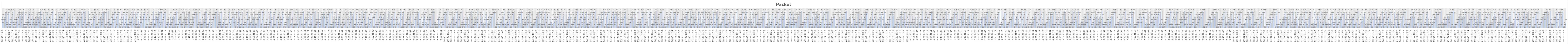
| Category | Packet ID |
|---|---|
| 0.8333912037037038 | 3 |
| 0.8335069444444444 | 4 |
| 0.834212962962963 | 5 |
| 0.8348726851851852 | 2 |
| 0.8348726851851852 | 2 |
| 0.8352199074074074 | 5 |
| 0.8355439814814815 | 3 |
| 0.8356597222222222 | 4 |
| 0.8359375 | 3 |
| 0.836388888888889 | 5 |
| 0.8365625 | 6 |
| 0.8367013888888889 | 4 |
| 0.8367708333333334 | 6 |
| 0.8373379629629629 | 7 |
| 0.8373726851851852 | 1 |
| 0.8377314814814815 | 2 |
| 0.838275462962963 | 0 |
| 0.8386226851851851 | 1 |
| 0.8389583333333334 | 5 |
| 0.8389814814814814 | 6 |
| 0.8395486111111111 | 7 |
| 0.8403125 | 6 |
| 0.8405092592592592 | 0 |
| 0.8408333333333333 | 7 |
| 0.8408564814814815 | 1 |
| 0.8411921296296296 | 0 |
| 0.8417824074074075 | 3 |
| 0.842650462962963 | 2 |
| 0.8435300925925926 | 4 |
| 0.8440393518518517 | 5 |
| 0.8446064814814815 | 7 |
| 0.8448726851851852 | 6 |
| 0.8449421296296297 | 2 |
| 0.8449768518518518 | 0 |
| 0.8451041666666667 | 1 |
| 0.8451967592592592 | 7 |
| 0.8452777777777777 | 2 |
| 0.8464583333333334 | 3 |
| 0.848900462962963 | 1 |
| 0.8489699074074074 | 0 |
| 0.8489930555555555 | 3 |
| 0.8490856481481481 | 2 |
| 0.8493750000000001 | 4 |
| 0.8502777777777778 | 3 |
| 0.8506712962962962 | 4 |
| 0.8513773148148148 | 3 |
| 0.8528819444444444 | 5 |
| 0.8530787037037038 | 4 |
| 0.8532060185185185 | 4 |
| 0.8536342592592593 | 6 |
| 0.8540625 | 1 |
| 0.8558333333333333 | 7 |
| 0.856412037037037 | 5 |
| 0.8565625 | 6 |
| 0.8567361111111111 | 5 |
| 0.8569328703703704 | 2 |
| 0.8573842592592592 | 7 |
| 0.857488425925926 | 6 |
| 0.8580092592592593 | 3 |
| 0.8587962962962963 | 4 |
| 0.858900462962963 | 5 |
| 0.8590509259259259 | 6 |
| 0.8594444444444443 | 0 |
| 0.8596990740740741 | 7 |
| 0.8597453703703705 | 1 |
| 0.8598842592592592 | 7 |
| 0.8600231481481481 | 0 |
| 0.861099537037037 | 5 |
| 0.8619791666666666 | 0 |
| 0.8622800925925925 | 1 |
| 0.8624884259259259 | 6 |
| 0.8638078703703704 | 2 |
| 0.8639236111111112 | 0 |
| 0.8643171296296296 | 1 |
| 0.864375 | 2 |
| 0.8653124999999999 | 3 |
| 0.866400462962963 | 2 |
| 0.8665972222222221 | 4 |
| 0.8668634259259259 | 7 |
| 0.8669328703703704 | 5 |
| 0.8672453703703704 | 0 |
| 0.8680208333333334 | 6 |
| 0.8682407407407408 | 1 |
| 0.8682986111111112 | 2 |
| 0.868576388888889 | 7 |
| 0.8692361111111112 | 3 |
| 0.8699074074074074 | 0 |
| 0.8703587962962963 | 3 |
| 0.8705324074074073 | 4 |
| 0.8708680555555556 | 5 |
| 0.87125 | 1 |
| 0.8714351851851853 | 2 |
| 0.8719675925925926 | 6 |
| 0.8725231481481481 | 7 |
| 0.8726504629629629 | 3 |
| 0.8730439814814814 | 3 |
| 0.8738657407407407 | 0 |
| 0.8740162037037037 | 1 |
| 0.8756365740740741 | 4 |
| 0.8756828703703704 | 4 |
| 0.8761458333333333 | 2 |
| 0.8777893518518519 | 5 |
| 0.877986111111111 | 1 |
| 0.8784490740740741 | 4 |
| 0.8791203703703704 | 6 |
| 0.8792476851851853 | 5 |
| 0.8794097222222222 | 3 |
| 0.8796875000000001 | 4 |
| 0.880011574074074 | 6 |
| 0.8801388888888889 | 2 |
| 0.8804398148148148 | 5 |
| 0.8805787037037037 | 5 |
| 0.8819212962962962 | 6 |
| 0.8822685185185185 | 7 |
| 0.8823148148148148 | 7 |
| 0.8828472222222222 | 0 |
| 0.8834143518518518 | 3 |
| 0.8837037037037038 | 4 |
| 0.8844560185185185 | 5 |
| 0.8849189814814814 | 1 |
| 0.8851736111111111 | 7 |
| 0.8857060185185185 | 0 |
| 0.8861458333333333 | 6 |
| 0.8863657407407407 | 2 |
| 0.8865740740740741 | 0 |
| 0.8877893518518518 | 3 |
| 0.8878125 | 1 |
| 0.8890046296296297 | 7 |
| 0.8892708333333333 | 2 |
| 0.8895370370370371 | 0 |
| 0.8901967592592593 | 6 |
| 0.8902199074074074 | 4 |
| 0.8904861111111111 | 5 |
| 0.8907175925925926 | 3 |
| 0.8908101851851852 | 6 |
| 0.8909837962962963 | 1 |
| 0.8910416666666667 | 2 |
| 0.8920023148148148 | 3 |
| 0.8930671296296296 | 7 |
| 0.8931944444444445 | 4 |
| 0.8933217592592593 | 4 |
| 0.893449074074074 | 1 |
| 0.893449074074074 | 5 |
| 0.8935995370370371 | 0 |
| 0.8936689814814814 | 5 |
| 0.8937268518518519 | 2 |
| 0.8937847222222222 | 6 |
| 0.8947916666666668 | 6 |
| 0.8953587962962963 | 7 |
| 0.8954398148148148 | 3 |
| 0.8961226851851851 | 7 |
| 0.8966898148148149 | 0 |
| 0.896724537037037 | 0 |
| 0.897337962962963 | 1 |
| 0.8975462962962962 | 1 |
| 0.8976388888888889 | 2 |
| 0.8976736111111111 | 4 |
| 0.897824074074074 | 2 |
| 0.8982638888888889 | 3 |
| 0.8990046296296296 | 5 |
| 0.8991782407407407 | 7 |
| 0.8995486111111112 | 3 |
| 0.8997569444444444 | 0 |
| 0.9004050925925925 | 1 |
| 0.9007175925925925 | 2 |
| 0.9009375 | 1 |
| 0.9011342592592593 | 6 |
| 0.9013541666666667 | 3 |
| 0.9017939814814815 | 4 |
| 0.9031250000000001 | 5 |
| 0.9031250000000001 | 2 |
| 0.9052662037037037 | 6 |
| 0.9059606481481483 | 7 |
| 0.9064699074074074 | 3 |
| 0.9067476851851852 | 4 |
| 0.9067592592592592 | 4 |
| 0.9075347222222222 | 5 |
| 0.9075578703703703 | 5 |
| 0.9099537037037037 | 4 |
| 0.9101273148148148 | 7 |
| 0.9103472222222222 | 0 |
| 0.9107175925925927 | 6 |
| 0.9107754629629629 | 5 |
| 0.9120023148148149 | 7 |
| 0.9121643518518519 | 1 |
| 0.9133912037037036 | 6 |
| 0.9134259259259259 | 2 |
| 0.9139814814814815 | 6 |
| 0.914537037037037 | 0 |
| 0.9151273148148148 | 0 |
| 0.9152777777777777 | 7 |
| 0.9158564814814815 | 3 |
| 0.9163310185185186 | 7 |
| 0.9163773148148149 | 1 |
| 0.916875 | 0 |
| 0.9176388888888889 | 2 |
| 0.9180555555555556 | 4 |
| 0.9184490740740742 | 0 |
| 0.9198726851851852 | 5 |
| 0.919988425925926 | 1 |
| 0.9200810185185185 | 3 |
| 0.9202430555555555 | 6 |
| 0.9204745370370371 | 2 |
| 0.9208912037037037 | 1 |
| 0.9211805555555556 | 2 |
| 0.921423611111111 | 7 |
| 0.9222916666666667 | 4 |
| 0.9223148148148148 | 0 |
| 0.9229398148148148 | 3 |
| 0.9233796296296296 | 1 |
| 0.9238773148148148 | 2 |
| 0.9241203703703703 | 5 |
| 0.9245023148148147 | 6 |
| 0.9246527777777778 | 1 |
| 0.9252314814814815 | 4 |
| 0.9256828703703704 | 7 |
| 0.9265856481481481 | 0 |
| 0.9265856481481481 | 5 |
| 0.9274421296296297 | 2 |
| 0.9280092592592593 | 3 |
| 0.9283564814814814 | 3 |
| 0.9284722222222223 | 4 |
| 0.9285185185185184 | 5 |
| 0.9287731481481482 | 6 |
| 0.9289236111111111 | 1 |
| 0.9297569444444443 | 4 |
| 0.930300925925926 | 5 |
| 0.9317361111111112 | 2 |
| 0.9318749999999999 | 3 |
| 0.9323032407407408 | 3 |
| 0.9324421296296297 | 6 |
| 0.9327662037037037 | 4 |
| 0.9328240740740741 | 5 |
| 0.9330439814814815 | 6 |
| 0.933287037037037 | 4 |
| 0.9337384259259259 | 7 |
| 0.9338310185185185 | 5 |
| 0.9341782407407407 | 7 |
| 0.9358449074074073 | 0 |
| 0.936111111111111 | 1 |
| 0.9366319444444445 | 6 |
| 0.9366319444444445 | 2 |
| 0.9367708333333334 | 6 |
| 0.9368287037037036 | 7 |
| 0.9376851851851852 | 3 |
| 0.9377777777777778 | 7 |
| 0.9379861111111111 | 4 |
| 0.9382407407407407 | 0 |
| 0.9390740740740741 | 0 |
| 0.9394675925925925 | 0 |
| 0.9395370370370371 | 1 |
| 0.9397337962962963 | 1 |
| 0.9401041666666666 | 1 |
| 0.9402662037037036 | 2 |
| 0.9411805555555556 | 7 |
| 0.9413194444444444 | 2 |
| 0.9413310185185185 | 3 |
| 0.941400462962963 | 2 |
| 0.9416319444444444 | 4 |
| 0.9433680555555556 | 5 |
| 0.9434490740740741 | 0 |
| 0.9438194444444444 | 3 |
| 0.9439004629629629 | 3 |
| 0.9439004629629629 | 1 |
| 0.9439930555555556 | 4 |
| 0.9450462962962963 | 6 |
| 0.9456944444444444 | 2 |
| 0.9461574074074074 | 4 |
| 0.9470949074074074 | 5 |
| 0.9480208333333334 | 5 |
| 0.9482060185185185 | 3 |
| 0.9483912037037037 | 4 |
| 0.9484027777777778 | 6 |
| 0.9487962962962962 | 6 |
| 0.9496064814814815 | 7 |
| 0.9498842592592592 | 7 |
| 0.9504861111111111 | 0 |
| 0.9505324074074074 | 0 |
| 0.9511342592592592 | 5 |
| 0.9529282407407407 | 1 |
| 0.9530671296296296 | 1 |
| 0.9534143518518517 | 2 |
| 0.9537037037037037 | 7 |
| 0.9543171296296297 | 0 |
| 0.9546064814814814 | 3 |
| 0.9555671296296296 | 5 |
| 0.955787037037037 | 2 |
| 0.9557986111111111 | 6 |
| 0.9563773148148148 | 3 |
| 0.9565740740740741 | 4 |
| 0.956851851851852 | 4 |
| 0.956875 | 5 |
| 0.9568981481481481 | 5 |
| 0.9569328703703704 | 1 |
| 0.9572916666666668 | 2 |
| 0.9579050925925926 | 6 |
| 0.9582291666666666 | 7 |
| 0.9584953703703704 | 3 |
| 0.9602662037037036 | 6 |
| 0.960486111111111 | 4 |
| 0.9607986111111111 | 5 |
| 0.9609143518518519 | 7 |
| 0.9609375 | 6 |
| 0.9609606481481481 | 0 |
| 0.9610069444444443 | 0 |
| 0.9618402777777778 | 6 |
| 0.9621064814814816 | 1 |
| 0.9627083333333334 | 7 |
| 0.9645717592592593 | 1 |
| 0.9648958333333333 | 7 |
| 0.9649768518518518 | 0 |
| 0.9650694444444444 | 2 |
| 0.9654050925925927 | 2 |
| 0.9654282407407407 | 7 |
| 0.9654513888888889 | 0 |
| 0.9657754629629629 | 3 |
| 0.9659027777777779 | 3 |
| 0.9666087962962964 | 1 |
| 0.9677430555555556 | 0 |
| 0.9682060185185185 | 1 |
| 0.9685995370370369 | 1 |
| 0.9685995370370369 | 4 |
| 0.9690972222222222 | 2 |
| 0.969212962962963 | 5 |
| 0.9696527777777778 | 4 |
| 0.9696875 | 6 |
| 0.969826388888889 | 3 |
| 0.9699305555555555 | 2 |
| 0.9700347222222222 | 2 |
| 0.9704282407407407 | 3 |
| 0.9705208333333334 | 5 |
| 0.9707986111111112 | 7 |
| 0.9715162037037036 | 6 |
| 0.9726041666666667 | 3 |
| 0.9727662037037037 | 0 |
| 0.9727893518518518 | 4 |
| 0.9731481481481481 | 4 |
| 0.9732986111111112 | 1 |
| 0.97375 | 4 |
| 0.973761574074074 | 5 |
| 0.974224537037037 | 6 |
| 0.9742824074074075 | 7 |
| 0.9746296296296296 | 5 |
| 0.9753472222222223 | 7 |
| 0.9756481481481482 | 6 |
| 0.9767013888888889 | 2 |
| 0.9772916666666666 | 3 |
| 0.9773263888888889 | 0 |
| 0.9774305555555555 | 0 |
| 0.9778703703703703 | 1 |
| 0.978449074074074 | 7 |
| 0.9795138888888889 | 4 |
| 0.9801157407407407 | 5 |
| 0.9812847222222222 | 2 |
| 0.9816435185185185 | 0 |
| 0.981886574074074 | 3 |
| 0.9841203703703704 | 4 |
| 0.9844444444444443 | 5 |
| 0.9845601851851852 | 6 |
| 0.9849074074074075 | 6 |
| 0.985162037037037 | 1 |
| 0.9852314814814815 | 2 |
| 0.9857754629629629 | 7 |
| 0.9869212962962962 | 0 |
| 0.9874074074074074 | 7 |
| 0.9881365740740741 | 3 |
| 0.9890856481481481 | 5 |
| 0.9891898148148148 | 6 |
| 0.9894907407407407 | 1 |
| 0.9895601851851853 | 2 |
| 0.9901967592592592 | 0 |
| 0.9904050925925926 | 7 |
| 0.9913773148148147 | 1 |
| 0.9915625 | 0 |
| 0.9925 | 3 |
| 0.9926041666666667 | 4 |
| 0.9945601851851852 | 1 |
| 0.9947685185185186 | 2 |
| 0.9949537037037036 | 5 |
| 0.9952314814814814 | 2 |
| 0.9952777777777778 | 3 |
| 0.9959606481481481 | 6 |
| 0.997037037037037 | 4 |
| 0.9980555555555556 | 4 |
| 0.9984722222222223 | 7 |
| 0.9986805555555556 | 5 |
| 0.9991550925925926 | 6 |
| 0.9992592592592593 | 1 |
| 0.9994212962962963 | 5 |
| 0.9995949074074074 | 3 |
| 0.9999305555555557 | 2 |
| 0.00030092592592592595 | 7 |
| 0.00042824074074074075 | 6 |
| 0.0005092592592592592 | 0 |
| 0.0011921296296296296 | 1 |
| 0.001412037037037037 | 4 |
| 0.0014351851851851854 | 5 |
| 0.002314814814814815 | 0 |
| 0.002870370370370371 | 1 |
| 0.0029861111111111113 | 7 |
| 0.0036226851851851854 | 6 |
| 0.00431712962962963 | 3 |
| 0.005046296296296296 | 0 |
| 0.005636574074074074 | 7 |
| 0.005740740740740742 | 1 |
| 0.006030092592592593 | 2 |
| 0.006145833333333333 | 4 |
| 0.006168981481481481 | 5 |
| 0.006354166666666667 | 2 |
| 0.006979166666666667 | 3 |
| 0.008368055555555556 | 6 |
| 0.009247685185185185 | 4 |
| 0.010393518518518519 | 7 |
| 0.01064814814814815 | 2 |
| 0.012152777777777778 | 3 |
| 0.012962962962962963 | 4 |
| 0.01347222222222222 | 5 |
| 0.014317129629629631 | 5 |
| 0.014421296296296295 | 6 |
| 0.014467592592592593 | 6 |
| 0.015243055555555557 | 7 |
| 0.015671296296296298 | 7 |
| 0.01685185185185185 | 0 |
| 0.016863425925925928 | 3 |
| 0.017685185185185182 | 4 |
| 0.017997685185185186 | 0 |
| 0.018206018518518517 | 5 |
| 0.018912037037037036 | 1 |
| 0.019212962962962963 | 6 |
| 0.02 | 7 |
| 0.02008101851851852 | 0 |
| 0.020729166666666667 | 2 |
| 0.021504629629629627 | 3 |
| 0.02246527777777778 | 4 |
| 0.022789351851851852 | 0 |
| 0.023715277777777776 | 1 |
| 0.024699074074074078 | 1 |
| 0.024918981481481483 | 0 |
| 0.02539351851851852 | 2 |
| 0.025567129629629634 | 2 |
| 0.025821759259259256 | 1 |
| 0.025914351851851855 | 5 |
| 0.026342592592592588 | 3 |
| 0.026446759259259264 | 6 |
| 0.02732638888888889 | 4 |
| 0.02832175925925926 | 7 |
| 0.02951388888888889 | 0 |
| 0.029861111111111113 | 3 |
| 0.029988425925925922 | 2 |
| 0.030000000000000002 | 1 |
| 0.030694444444444444 | 1 |
| 0.030821759259259257 | 5 |
| 0.03135416666666666 | 6 |
| 0.03172453703703703 | 4 |
| 0.03175925925925926 | 5 |
| 0.03184027777777778 | 2 |
| 0.03239583333333333 | 3 |
| 0.032719907407407406 | 4 |
| 0.033125 | 3 |
| 0.0332175925925926 | 5 |
| 0.03326388888888889 | 7 |
| 0.033344907407407406 | 4 |
| 0.033900462962962966 | 5 |
| 0.03399305555555556 | 6 |
| 0.03446759259259259 | 0 |
| 0.034895833333333334 | 2 |
| 0.0349537037037037 | 1 |
| 0.035937500000000004 | 6 |
| 0.03606481481481481 | 7 |
| 0.03606481481481481 | 6 |
| 0.03612268518518518 | 7 |
| 0.036828703703703704 | 2 |
| 0.03730324074074074 | 3 |
| 0.03760416666666667 | 7 |
| 0.037638888888888895 | 4 |
| 0.03813657407407407 | 3 |
| 0.038356481481481484 | 4 |
| 0.03891203703703704 | 5 |
| 0.04099537037037037 | 6 |
| 0.04100694444444444 | 6 |
| 0.04116898148148148 | 7 |
| 0.04226851851851852 | 0 |
| 0.0425462962962963 | 7 |
| 0.04289351851851852 | 0 |
| 0.042951388888888886 | 1 |
| 0.04378472222222222 | 1 |
| 0.04438657407407407 | 2 |
| 0.0449074074074074 | 3 |
| 0.04532407407407407 | 2 |
| 0.045578703703703705 | 4 |
| 0.04605324074074074 | 3 |
| 0.04725694444444445 | 5 |
| 0.047407407407407405 | 0 |
| 0.04787037037037037 | 0 |
| 0.04792824074074074 | 1 |
| 0.047962962962962964 | 4 |
| 0.04868055555555556 | 6 |
| 0.04894675925925926 | 1 |
| 0.04936342592592593 | 2 |
| 0.049895833333333334 | 3 |
| 0.050509259259259254 | 2 |
| 0.050567129629629635 | 4 |
| 0.0508912037037037 | 0 |
| 0.05125 | 3 |
| 0.05226851851851852 | 5 |
| 0.05226851851851852 | 5 |
| 0.052986111111111116 | 7 |
| 0.053182870370370366 | 4 |
| 0.05368055555555556 | 6 |
| 0.054560185185185184 | 0 |
| 0.05491898148148148 | 6 |
| 0.0567824074074074 | 1 |
| 0.0575462962962963 | 5 |
| 0.058020833333333334 | 7 |
| 0.05912037037037037 | 7 |
| 0.05960648148148148 | 0 |
| 0.059687500000000004 | 0 |
| 0.05975694444444444 | 1 |
| 0.06024305555555556 | 6 |
| 0.06107638888888889 | 2 |
| 0.06131944444444445 | 2 |
| 0.06319444444444444 | 3 |
| 0.06337962962962963 | 4 |
| 0.06354166666666666 | 3 |
| 0.06387731481481482 | 4 |
| 0.06393518518518519 | 5 |
| 0.06409722222222222 | 1 |
| 0.064375 | 5 |
| 0.06449074074074074 | 7 |
| 0.06483796296296296 | 1 |
| 0.06506944444444444 | 0 |
| 0.06512731481481482 | 2 |
| 0.06537037037037037 | 6 |
| 0.06640046296296297 | 2 |
| 0.06652777777777778 | 7 |
| 0.06682870370370371 | 3 |
| 0.06731481481481481 | 6 |
| 0.06827546296296295 | 0 |
| 0.06828703703703703 | 3 |
| 0.06847222222222223 | 4 |
| 0.06849537037037036 | 1 |
| 0.0687037037037037 | 2 |
| 0.06887731481481481 | 7 |
| 0.06902777777777779 | 5 |
| 0.06918981481481482 | 3 |
| 0.06954861111111112 | 1 |
| 0.06974537037037037 | 4 |
| 0.06979166666666667 | 5 |
| 0.07047453703703704 | 6 |
| 0.07059027777777778 | 2 |
| 0.07099537037037036 | 6 |
| 0.07164351851851852 | 7 |
| 0.07231481481481482 | 3 |
| 0.07339120370370371 | 0 |
| 0.07361111111111111 | 1 |
| 0.07383101851851852 | 2 |
| 0.07431712962962962 | 3 |
| 0.07431712962962962 | 0 |
| 0.07437500000000001 | 1 |
| 0.07527777777777778 | 4 |
| 0.07532407407407408 | 5 |
| 0.0758449074074074 | 2 |
| 0.0763888888888889 | 3 |
| 0.07707175925925926 | 4 |
| 0.0775 | 7 |
| 0.0787962962962963 | 5 |
| 0.07914351851851852 | 4 |
| 0.08025462962962963 | 6 |
| 0.08118055555555555 | 5 |
| 0.08313657407407408 | 7 |
| 0.08432870370370371 | 4 |
| 0.08468750000000001 | 7 |
| 0.08497685185185185 | 6 |
| 0.08614583333333332 | 7 |
| 0.08637731481481481 | 5 |
| 0.08689814814814815 | 0 |
| 0.08850694444444444 | 0 |
| 0.08855324074074074 | 1 |
| 0.08905092592592594 | 1 |
| 0.0897800925925926 | 2 |
| 0.08994212962962962 | 2 |
| 0.09019675925925925 | 6 |
| 0.09136574074074073 | 7 |
| 0.09142361111111112 | 3 |
| 0.09163194444444445 | 1 |
| 0.09212962962962963 | 0 |
| 0.09322916666666665 | 2 |
| 0.09379629629629631 | 1 |
| 0.09430555555555555 | 0 |
| 0.09469907407407407 | 4 |
| 0.09484953703703704 | 1 |
| 0.0949537037037037 | 5 |
| 0.09515046296296296 | 3 |
| 0.09519675925925926 | 2 |
| 0.09534722222222221 | 4 |
| 0.09554398148148148 | 6 |
| 0.09559027777777777 | 2 |
| 0.09591435185185186 | 5 |
| 0.0963888888888889 | 7 |
| 0.09726851851851852 | 3 |
| 0.09738425925925925 | 6 |
| 0.09857638888888888 | 7 |
| 0.09873842592592592 | 0 |
| 0.09962962962962962 | 1 |
| 0.10037037037037037 | 0 |
| 0.10059027777777778 | 4 |
| 0.10059027777777778 | 1 |
| 0.1007986111111111 | 2 |
| 0.10081018518518518 | 2 |
| 0.10084490740740741 | 5 |
| 0.10130787037037037 | 3 |
| 0.10144675925925926 | 6 |
| 0.10166666666666667 | 3 |
| 0.10230324074074075 | 7 |
| 0.10358796296296297 | 3 |
| 0.1046875 | 0 |
| 0.10559027777777778 | 1 |
| 0.1067361111111111 | 5 |
| 0.10677083333333333 | 2 |
| 0.10699074074074073 | 3 |
| 0.10960648148148149 | 3 |
| 0.11040509259259258 | 4 |
| 0.11094907407407407 | 4 |
| 0.11153935185185186 | 4 |
| 0.11209490740740741 | 5 |
| 0.1135648148148148 | 5 |
| 0.11362268518518519 | 5 |
| 0.11563657407407407 | 6 |
| 0.11706018518518518 | 4 |
| 0.11739583333333332 | 6 |
| 0.11752314814814814 | 6 |
| 0.11780092592592593 | 7 |
| 0.11791666666666667 | 7 |
| 0.11871527777777778 | 7 |
| 0.11873842592592593 | 0 |
| 0.11949074074074074 | 0 |
| 0.11972222222222222 | 5 |
| 0.12038194444444444 | 1 |
| 0.12064814814814816 | 2 |
| 0.12104166666666666 | 6 |
| 0.12119212962962962 | 1 |
| 0.12262731481481481 | 2 |
| 0.12265046296296296 | 3 |
| 0.12333333333333334 | 7 |
| 0.12361111111111112 | 6 |
| 0.1240162037037037 | 7 |
| 0.1241550925925926 | 0 |
| 0.1246412037037037 | 0 |
| 0.12568287037037038 | 1 |
| 0.1258101851851852 | 2 |
| 0.1258101851851852 | 1 |
| 0.1260763888888889 | 2 |
| 0.12782407407407406 | 4 |
| 0.12810185185185186 | 3 |
| 0.12817129629629628 | 5 |
| 0.12886574074074073 | 6 |
| 0.1290625 | 7 |
| 0.12930555555555556 | 0 |
| 0.12961805555555556 | 3 |
| 0.12996527777777778 | 1 |
| 0.13096064814814815 | 0 |
| 0.13150462962962964 | 4 |
| 0.1320138888888889 | 1 |
| 0.13214120370370372 | 2 |
| 0.13322916666666665 | 5 |
| 0.1332986111111111 | 4 |
| 0.13364583333333332 | 5 |
| 0.1338310185185185 | 2 |
| 0.13434027777777777 | 6 |
| 0.1345486111111111 | 7 |
| 0.13465277777777776 | 3 |
| 0.13478009259259258 | 0 |
| 0.13545138888888889 | 1 |
| 0.13599537037037038 | 3 |
| 0.1365625 | 3 |
| 0.13696759259259259 | 6 |
| 0.13783564814814817 | 4 |
| 0.13791666666666666 | 4 |
| 0.13804398148148148 | 5 |
| 0.13814814814814816 | 4 |
| 0.13918981481481482 | 7 |
| 0.13929398148148148 | 6 |
| 0.13934027777777777 | 2 |
| 0.13966435185185186 | 5 |
| 0.1398611111111111 | 5 |
| 0.14136574074074074 | 7 |
| 0.14208333333333334 | 3 |
| 0.14217592592592593 | 0 |
| 0.14336805555555557 | 4 |
| 0.14346064814814816 | 6 |
| 0.14357638888888888 | 5 |
| 0.14482638888888888 | 6 |
| 0.1448611111111111 | 0 |
| 0.14488425925925927 | 1 |
| 0.14532407407407408 | 2 |
| 0.1457175925925926 | 7 |
| 0.1459375 | 3 |
| 0.14690972222222223 | 7 |
| 0.1484375 | 4 |
| 0.14873842592592593 | 0 |
| 0.14900462962962963 | 6 |
| 0.15042824074074074 | 0 |
| 0.15046296296296297 | 1 |
| 0.15057870370370371 | 5 |
| 0.15090277777777777 | 2 |
| 0.15134259259259258 | 7 |
| 0.1515162037037037 | 3 |
| 0.15171296296296297 | 6 |
| 0.1518287037037037 | 7 |
| 0.1521875 | 0 |
| 0.15261574074074075 | 1 |
| 0.15274305555555556 | 0 |
| 0.15387731481481481 | 1 |
| 0.15403935185185186 | 4 |
| 0.1541435185185185 | 2 |
| 0.1549537037037037 | 2 |
| 0.15592592592592594 | 1 |
| 0.15618055555555554 | 5 |
| 0.1562037037037037 | 3 |
| 0.15687500000000001 | 2 |
| 0.1573263888888889 | 6 |
| 0.15744212962962964 | 7 |
| 0.1580324074074074 | 3 |
| 0.15827546296296297 | 3 |
| 0.1583564814814815 | 0 |
| 0.15854166666666666 | 4 |
| 0.1593287037037037 | 1 |
| 0.16100694444444444 | 4 |
| 0.1615162037037037 | 4 |
| 0.1615625 | 1 |
| 0.16170138888888888 | 2 |
| 0.16186342592592592 | 5 |
| 0.16252314814814814 | 2 |
| 0.1625810185185185 | 6 |
| 0.16278935185185187 | 7 |
| 0.16302083333333334 | 0 |
| 0.1631365740740741 | 5 |
| 0.16368055555555555 | 3 |
| 0.16371527777777778 | 1 |
| 0.16418981481481482 | 4 |
| 0.16420138888888888 | 6 |
| 0.16506944444444446 | 3 |
| 0.1672685185185185 | 7 |
| 0.1673148148148148 | 5 |
| 0.16743055555555555 | 0 |
| 0.16767361111111112 | 2 |
| 0.16783564814814814 | 4 |
| 0.1683564814814815 | 1 |
| 0.16837962962962963 | 2 |
| 0.16998842592592592 | 3 |
| 0.17 | 5 |
| 0.17020833333333332 | 4 |
| 0.17048611111111112 | 3 |
| 0.1708333333333333 | 5 |
| 0.17107638888888888 | 6 |
| 0.17141203703703703 | 6 |
| 0.17178240740740738 | 4 |
| 0.17201388888888888 | 5 |
| 0.17302083333333332 | 5 |
| 0.17328703703703704 | 6 |
| 0.1741898148148148 | 7 |
| 0.17435185185185187 | 0 |
| 0.17530092592592594 | 1 |
| 0.17531249999999998 | 2 |
| 0.17541666666666667 | 7 |
| 0.1767824074074074 | 7 |
| 0.17694444444444446 | 3 |
| 0.1770023148148148 | 6 |
| 0.1771412037037037 | 6 |
| 0.17717592592592593 | 4 |
| 0.17780092592592592 | 5 |
| 0.17811342592592594 | 0 |
| 0.17866898148148147 | 1 |
| 0.17893518518518517 | 7 |
| 0.17899305555555556 | 0 |
| 0.17902777777777779 | 1 |
| 0.1791435185185185 | 2 |
| 0.17947916666666666 | 2 |
| 0.17980324074074075 | 0 |
| 0.18010416666666665 | 3 |
| 0.18158564814814815 | 1 |
| 0.1825462962962963 | 7 |
| 0.18268518518518517 | 4 |
| 0.1838773148148148 | 0 |
| 0.18406250000000002 | 6 |
| 0.18444444444444444 | 1 |
| 0.18487268518518518 | 5 |
| 0.18491898148148148 | 2 |
| 0.18578703703703703 | 2 |
| 0.1860185185185185 | 7 |
| 0.18604166666666666 | 6 |
| 0.1861574074074074 | 7 |
| 0.18671296296296294 | 3 |
| 0.18677083333333333 | 4 |
| 0.18686342592592595 | 3 |
| 0.18689814814814817 | 0 |
| 0.1869097222222222 | 4 |
| 0.18709490740740742 | 0 |
| 0.18730324074074076 | 5 |
| 0.18775462962962963 | 6 |
| 0.1887037037037037 | 1 |
| 0.19023148148148147 | 5 |
| 0.19027777777777777 | 6 |
| 0.19037037037037038 | 1 |
| 0.1913425925925926 | 2 |
| 0.1915625 | 7 |
| 0.19193287037037035 | 7 |
| 0.19252314814814817 | 3 |
| 0.19253472222222223 | 3 |
| 0.19259259259259257 | 4 |
| 0.19275462962962964 | 0 |
| 0.19297453703703704 | 2 |
| 0.1930439814814815 | 4 |
| 0.193125 | 5 |
| 0.19337962962962962 | 1 |
| 0.1934375 | 0 |
| 0.19357638888888887 | 6 |
| 0.1940625 | 3 |
| 0.1941087962962963 | 4 |
| 0.19413194444444445 | 1 |
| 0.19462962962962962 | 2 |
| 0.1947685185185185 | 2 |
| 0.19538194444444446 | 3 |
| 0.19652777777777777 | 3 |
| 0.1974074074074074 | 7 |
| 0.19747685185185185 | 5 |
| 0.19753472222222224 | 6 |
| 0.19859953703703703 | 0 |
| 0.19902777777777778 | 4 |
| 0.19920138888888891 | 7 |
| 0.19923611111111109 | 1 |
| 0.20011574074074076 | 5 |
| 0.2006365740740741 | 2 |
| 0.20072916666666665 | 0 |
| 0.2014351851851852 | 1 |
| 0.20194444444444445 | 2 |
| 0.20204861111111114 | 5 |
| 0.2024074074074074 | 3 |
| 0.2024074074074074 | 6 |
| 0.20254629629629628 | 7 |
| 0.20270833333333335 | 3 |
| 0.2032638888888889 | 4 |
| 0.2049189814814815 | 4 |
| 0.20586805555555557 | 0 |
| 0.20600694444444445 | 5 |
| 0.20627314814814815 | 6 |
| 0.20770833333333336 | 5 |
| 0.2079513888888889 | 6 |
| 0.20832175925925925 | 6 |
| 0.20846064814814813 | 7 |
| 0.20871527777777776 | 1 |
| 0.20934027777777778 | 2 |
| 0.20993055555555554 | 3 |
| 0.20997685185185186 | 7 |
| 0.21069444444444443 | 4 |
| 0.2117824074074074 | 7 |
| 0.21179398148148146 | 0 |
| 0.21313657407407408 | 0 |
| 0.21371527777777777 | 1 |
| 0.21409722222222224 | 0 |
| 0.21420138888888887 | 2 |
| 0.21465277777777778 | 1 |
| 0.21519675925925927 | 5 |
| 0.21528935185185186 | 2 |
| 0.2154513888888889 | 6 |
| 0.21587962962962962 | 3 |
| 0.21681712962962962 | 4 |
| 0.21699074074074073 | 1 |
| 0.2175 | 7 |
| 0.21765046296296298 | 2 |
| 0.2192361111111111 | 5 |
| 0.2195601851851852 | 6 |
| 0.22168981481481484 | 0 |
| 0.22196759259259258 | 3 |
| 0.2220023148148148 | 3 |
| 0.22202546296296297 | 4 |
| 0.22240740740740741 | 4 |
| 0.22258101851851853 | 5 |
| 0.2228125 | 4 |
| 0.2230439814814815 | 6 |
| 0.22452546296296297 | 5 |
| 0.22461805555555556 | 1 |
| 0.22524305555555557 | 5 |
| 0.22528935185185184 | 2 |
| 0.22534722222222223 | 7 |
| 0.2255787037037037 | 6 |
| 0.22694444444444442 | 7 |
| 0.22711805555555556 | 0 |
| 0.2281712962962963 | 0 |
| 0.22881944444444444 | 1 |
| 0.22929398148148147 | 1 |
| 0.22969907407407408 | 3 |
| 0.23011574074074073 | 4 |
| 0.23024305555555555 | 2 |
| 0.23064814814814816 | 2 |
| 0.23108796296296297 | 3 |
| 0.23109953703703703 | 4 |
| 0.23122685185185185 | 5 |
| 0.2313888888888889 | 7 |
| 0.2320486111111111 | 3 |
| 0.23225694444444445 | 5 |
| 0.2331712962962963 | 0 |
| 0.23461805555555557 | 4 |
| 0.23474537037037035 | 6 |
| 0.2353587962962963 | 1 |
| 0.23554398148148148 | 7 |
| 0.23556712962962964 | 0 |
| 0.23572916666666666 | 5 |
| 0.23597222222222222 | 1 |
| 0.23671296296296296 | 2 |
| 0.23716435185185183 | 3 |
| 0.23717592592592593 | 4 |
| 0.23730324074074075 | 5 |
| 0.23809027777777778 | 6 |
| 0.2382291666666667 | 7 |
| 0.239375 | 6 |
| 0.23962962962962964 | 7 |
| 0.23989583333333334 | 0 |
| 0.24083333333333334 | 6 |
| 0.2414236111111111 | 2 |
| 0.24163194444444444 | 0 |
| 0.2416435185185185 | 7 |
| 0.24167824074074074 | 0 |
| 0.24209490740740738 | 1 |
| 0.2429513888888889 | 3 |
| 0.24456018518518519 | 1 |
| 0.24466435185185187 | 2 |
| 0.245 | 3 |
| 0.24519675925925924 | 2 |
| 0.24579861111111112 | 3 |
| 0.2473263888888889 | 6 |
| 0.24755787037037036 | 2 |
| 0.24758101851851852 | 7 |
| 0.24785879629629629 | 0 |
| 0.24909722222222222 | 3 |
| 0.2500925925925926 | 1 |
| 0.2526851851851852 | 2 |
| 0.25288194444444445 | 4 |
| 0.2530324074074074 | 3 |
| 0.25535879629629626 | 5 |
| 0.25569444444444445 | 6 |
| 0.2559490740740741 | 4 |
| 0.2568634259259259 | 5 |
| 0.25788194444444446 | 4 |
| 0.2599884259259259 | 5 |
| 0.26113425925925926 | 6 |
| 0.26163194444444443 | 7 |
| 0.2621643518518519 | 4 |
| 0.26309027777777777 | 5 |
| 0.2633449074074074 | 7 |
| 0.2634606481481481 | 0 |
| 0.26554398148148145 | 0 |
| 0.26568287037037036 | 1 |
| 0.26609953703703704 | 4 |
| 0.26687500000000003 | 6 |
| 0.26707175925925924 | 2 |
| 0.26752314814814815 | 3 |
| 0.26753472222222224 | 4 |
| 0.26765046296296297 | 7 |
| 0.2676736111111111 | 5 |
| 0.2682291666666667 | 5 |
| 0.26912037037037034 | 0 |
| 0.26938657407407407 | 6 |
| 0.2712731481481481 | 6 |
| 0.27164351851851853 | 7 |
| 0.27194444444444443 | 1 |
| 0.27209490740740744 | 7 |
| 0.2721296296296296 | 0 |
| 0.27253472222222225 | 1 |
| 0.27315972222222223 | 6 |
| 0.2738773148148148 | 0 |
| 0.27393518518518517 | 7 |
| 0.27489583333333334 | 1 |
| 0.27490740740740743 | 2 |
| 0.2751388888888889 | 3 |
| 0.27542824074074074 | 0 |
| 0.2760185185185185 | 4 |
| 0.27716435185185184 | 5 |
| 0.27813657407407405 | 2 |
| 0.2782523148148148 | 6 |
| 0.27836805555555555 | 2 |
| 0.2792013888888889 | 3 |
| 0.27930555555555553 | 4 |
| 0.27949074074074076 | 7 |
| 0.27969907407407407 | 3 |
| 0.2803587962962963 | 1 |
| 0.28052083333333333 | 0 |
| 0.28122685185185187 | 1 |
| 0.28125 | 2 |
| 0.28144675925925927 | 5 |
| 0.2814699074074074 | 3 |
| 0.282349537037037 | 4 |
| 0.2835185185185185 | 5 |
| 0.2846064814814815 | 6 |
| 0.28533564814814816 | 6 |
| 0.2858449074074074 | 7 |
| 0.2858449074074074 | 7 |
| 0.2862037037037037 | 1 |
| 0.28682870370370367 | 0 |
| 0.286875 | 2 |
| 0.2868865740740741 | 0 |
| 0.28771990740740744 | 3 |
| 0.28782407407407407 | 4 |
| 0.28846064814814815 | 2 |
| 0.29 | 5 |
| 0.2900115740740741 | 1 |
| 0.2921875 | 3 |
| 0.29261574074074076 | 1 |
| 0.2930439814814815 | 4 |
| 0.29390046296296296 | 2 |
| 0.2939351851851852 | 6 |
| 0.29398148148148145 | 5 |
| 0.2944675925925926 | 7 |
| 0.29488425925925926 | 2 |
| 0.2953587962962963 | 4 |
| 0.2954513888888889 | 0 |
| 0.29608796296296297 | 3 |
| 0.2961226851851852 | 4 |
| 0.29613425925925924 | 5 |
| 0.2972916666666667 | 6 |
| 0.2986226851851852 | 3 |
| 0.29868055555555556 | 1 |
| 0.30181712962962964 | 4 |
| 0.3026273148148148 | 2 |
| 0.30297453703703703 | 7 |
| 0.3030324074074074 | 5 |
| 0.3042708333333333 | 6 |
| 0.30452546296296296 | 6 |
| 0.30483796296296295 | 3 |
| 0.30488425925925927 | 4 |
| 0.3048958333333333 | 5 |
| 0.30505787037037035 | 7 |
| 0.3059837962962963 | 0 |
| 0.3060648148148148 | 6 |
| 0.30613425925925924 | 7 |
| 0.3061689814814815 | 0 |
| 0.30657407407407405 | 0 |
| 0.3068287037037037 | 1 |
| 0.30755787037037036 | 1 |
| 0.3081597222222222 | 2 |
| 0.3086921296296296 | 2 |
| 0.3088310185185185 | 3 |
| 0.30953703703703705 | 5 |
| 0.31104166666666666 | 6 |
| 0.3118402777777778 | 7 |
| 0.3125 | 1 |
| 0.31252314814814813 | 2 |
| 0.31266203703703704 | 7 |
| 0.31269675925925927 | 0 |
| 0.31274305555555554 | 3 |
| 0.31364583333333335 | 4 |
| 0.31408564814814816 | 1 |
| 0.31460648148148146 | 3 |
| 0.31483796296296296 | 5 |
| 0.3148842592592593 | 0 |
| 0.31523148148148145 | 2 |
| 0.3157407407407407 | 1 |
| 0.3159490740740741 | 6 |
| 0.3170949074074074 | 2 |
| 0.31722222222222224 | 7 |
| 0.31777777777777777 | 3 |
| 0.318275462962963 | 0 |
| 0.3184837962962963 | 4 |
| 0.32015046296296296 | 5 |
| 0.320625 | 4 |
| 0.32115740740740745 | 5 |
| 0.3211921296296296 | 3 |
| 0.3227083333333333 | 6 |
| 0.32381944444444444 | 7 |
| 0.3241203703703704 | 1 |
| 0.3247222222222222 | 0 |
| 0.3257523148148148 | 1 |
| 0.32599537037037035 | 6 |
| 0.3261111111111111 | 7 |
| 0.32643518518518516 | 2 |
| 0.3267361111111111 | 0 |
| 0.3272337962962963 | 4 |
| 0.3275694444444444 | 4 |
| 0.3277777777777778 | 5 |
| 0.32924768518518516 | 5 |
| 0.32979166666666665 | 1 |
| 0.33006944444444447 | 2 |
| 0.33025462962962965 | 3 |
| 0.3307060185185185 | 2 |
| 0.33166666666666667 | 3 |
| 0.33185185185185184 | 6 |
| 0.3322569444444445 | 3 |
| 0.33265046296296297 | 6 |
| 0.3327662037037037 | 7 |
| 0.33284722222222224 | 4 |
| 0.33298611111111115 | 7 |
| 0.33328703703703705 | 4 |
| 0.3333912037037037 | 0 |
| 0.33346064814814813 | 5 |
| 0.33351851851851855 | 4 |
| 0.33368055555555554 | 6 |
| 0.3338888888888889 | 0 |
| 0.3342361111111111 | 5 |
| 0.3349421296296296 | 1 |
| 0.33517361111111116 | 6 |
| 0.33614583333333337 | 7 |
| 0.3364699074074074 | 1 |
| 0.3370717592592593 | 7 |
| 0.33738425925925924 | 2 |
| 0.33771990740740737 | 0 |
| 0.3383449074074074 | 3 |
| 0.3385416666666667 | 1 |
| 0.3390393518518518 | 2 |
| 0.3393171296296296 | 2 |
| 0.339537037037037 | 4 |
| 0.3398726851851852 | 0 |
| 0.34016203703703707 | 5 |
| 0.3403819444444445 | 6 |
| 0.34140046296296295 | 5 |
| 0.3415277777777778 | 3 |
| 0.3425810185185185 | 4 |
| 0.34284722222222225 | 7 |
| 0.34292824074074074 | 6 |
| 0.3429513888888889 | 1 |
| 0.3434027777777778 | 3 |
| 0.34354166666666663 | 5 |
| 0.34356481481481477 | 4 |
| 0.34369212962962964 | 5 |
| 0.3444444444444445 | 0 |
| 0.3444907407407407 | 6 |
| 0.3445833333333333 | 7 |
| 0.3446180555555556 | 0 |
| 0.34487268518518516 | 6 |
| 0.3452662037037037 | 1 |
| 0.3457638888888889 | 2 |
| 0.34604166666666664 | 1 |
| 0.34642361111111114 | 7 |
| 0.34656250000000005 | 2 |
| 0.34664351851851855 | 3 |
| 0.3467708333333333 | 4 |
| 0.34694444444444444 | 5 |
| 0.347025462962963 | 7 |
| 0.3472106481481481 | 2 |
| 0.34804398148148147 | 0 |
| 0.34825231481481483 | 6 |
| 0.3492592592592592 | 0 |
| 0.3495601851851852 | 1 |
| 0.3500462962962963 | 2 |
| 0.350162037037037 | 3 |
| 0.35032407407407407 | 4 |
| 0.3503819444444445 | 3 |
| 0.35040509259259256 | 4 |
| 0.3504513888888889 | 5 |
| 0.3509259259259259 | 5 |
| 0.3516435185185185 | 6 |
| 0.35193287037037035 | 7 |
| 0.35232638888888884 | 0 |
| 0.35238425925925926 | 1 |
| 0.35328703703703707 | 3 |
| 0.35344907407407405 | 6 |
| 0.35379629629629633 | 7 |
| 0.3548263888888889 | 0 |
| 0.3560532407407408 | 2 |
| 0.35612268518518514 | 3 |
| 0.35626157407407405 | 4 |
| 0.3563541666666667 | 1 |
| 0.35642361111111115 | 5 |
| 0.3568518518518518 | 2 |
| 0.35717592592592595 | 3 |
| 0.3572106481481481 | 4 |
| 0.3576851851851852 | 1 |
| 0.35773148148148143 | 5 |
| 0.3577546296296296 | 6 |
| 0.3584837962962963 | 2 |
| 0.3594560185185185 | 4 |
| 0.36000000000000004 | 5 |
| 0.36027777777777775 | 6 |
| 0.36149305555555555 | 7 |
| 0.36150462962962965 | 7 |
| 0.36188657407407404 | 0 |
| 0.3626388888888889 | 3 |
| 0.36437499999999995 | 4 |
| 0.36445601851851855 | 5 |
| 0.3646064814814815 | 0 |
| 0.36497685185185186 | 6 |
| 0.3650925925925926 | 7 |
| 0.36572916666666666 | 0 |
| 0.36634259259259255 | 1 |
| 0.3673263888888889 | 1 |
| 0.3681365740740741 | 2 |
| 0.3683796296296296 | 7 |
| 0.3688773148148148 | 1 |
| 0.3695138888888889 | 2 |
| 0.3698148148148148 | 2 |
| 0.37079861111111106 | 3 |
| 0.3715046296296296 | 0 |
| 0.3720023148148148 | 4 |
| 0.3722800925925926 | 6 |
| 0.37234953703703705 | 3 |
| 0.3726388888888889 | 5 |
| 0.37287037037037035 | 6 |
| 0.3729050925925926 | 3 |
| 0.3732523148148148 | 1 |
| 0.3741087962962963 | 4 |
| 0.37418981481481484 | 5 |
| 0.37501157407407404 | 7 |
| 0.3753935185185185 | 7 |
| 0.37549768518518517 | 4 |
| 0.3764351851851852 | 2 |
| 0.37702546296296297 | 0 |
| 0.37776620370370373 | 0 |
| 0.37785879629629626 | 1 |
| 0.3783680555555555 | 2 |
| 0.3783680555555555 | 5 |
| 0.3789699074074074 | 6 |
| 0.37916666666666665 | 1 |
| 0.3794675925925926 | 7 |
| 0.37960648148148146 | 0 |
| 0.379849537037037 | 3 |
| 0.38212962962962965 | 6 |
| 0.3824652777777778 | 4 |
| 0.3828587962962963 | 3 |
| 0.38302083333333337 | 4 |
| 0.3831481481481482 | 5 |
| 0.38425925925925924 | 2 |
| 0.38436342592592593 | 6 |
| 0.3849074074074074 | 7 |
| 0.3853587962962963 | 5 |
| 0.38560185185185186 | 1 |
| 0.3859490740740741 | 6 |
| 0.38645833333333335 | 7 |
| 0.3865740740740741 | 7 |
| 0.3865972222222222 | 2 |
| 0.3865972222222222 | 0 |
| 0.3871759259259259 | 3 |
| 0.3872569444444445 | 3 |
| 0.38761574074074073 | 0 |
| 0.3876273148148148 | 4 |
| 0.3876967592592593 | 0 |
| 0.38773148148148145 | 4 |
| 0.3888773148148148 | 5 |
| 0.38912037037037034 | 1 |
| 0.38916666666666666 | 1 |
| 0.3896759259259259 | 2 |
| 0.38986111111111116 | 6 |
| 0.3900115740740741 | 3 |
| 0.3900462962962963 | 4 |
| 0.3905787037037037 | 5 |
| 0.39082175925925927 | 7 |
| 0.3912731481481482 | 5 |
| 0.3926388888888889 | 1 |
| 0.3931712962962963 | 6 |
| 0.39363425925925927 | 2 |
| 0.3942824074074074 | 2 |
| 0.3942939814814815 | 3 |
| 0.3947685185185185 | 4 |
| 0.39488425925925924 | 0 |
| 0.39490740740740743 | 7 |
| 0.39491898148148147 | 1 |
| 0.39524305555555556 | 2 |
| 0.3965625 | 3 |
| 0.3966087962962963 | 4 |
| 0.39688657407407407 | 5 |
| 0.3972453703703704 | 3 |
| 0.3976967592592593 | 4 |
| 0.3983449074074074 | 5 |
| 0.39847222222222217 | 0 |
| 0.3989699074074074 | 5 |
| 0.39903935185185185 | 6 |
| 0.3999537037037037 | 6 |
| 0.4000578703703704 | 7 |
| 0.4007175925925926 | 1 |
| 0.40077546296296296 | 0 |
| 0.4009375 | 7 |
| 0.4012384259259259 | 6 |
| 0.40144675925925927 | 7 |
| 0.40199074074074076 | 7 |
| 0.40357638888888886 | 2 |
| 0.4039236111111111 | 1 |
| 0.404375 | 2 |
| 0.4046296296296296 | 0 |
| 0.4050578703703704 | 0 |
| 0.40509259259259256 | 1 |
| 0.40542824074074074 | 2 |
| 0.4055902777777778 | 0 |
| 0.40641203703703704 | 1 |
| 0.406724537037037 | 3 |
| 0.40675925925925926 | 3 |
| 0.4068055555555556 | 4 |
| 0.4070833333333333 | 5 |
| 0.40769675925925924 | 4 |
| 0.40784722222222225 | 1 |
| 0.40789351851851857 | 3 |
| 0.4092708333333333 | 6 |
| 0.40967592592592594 | 2 |
| 0.4103125 | 7 |
| 0.41072916666666665 | 2 |
| 0.4110416666666667 | 0 |
| 0.4127083333333333 | 4 |
| 0.41315972222222225 | 3 |
| 0.41390046296296296 | 3 |
| 0.41422453703703704 | 1 |
| 0.41468750000000004 | 2 |
| 0.41487268518518516 | 4 |
| 0.41582175925925924 | 4 |
| 0.41692129629629626 | 5 |
| 0.41709490740740746 | 5 |
| 0.4174189814814815 | 6 |
| 0.4177662037037037 | 6 |
| 0.4182523148148148 | 3 |
| 0.4187731481481482 | 5 |
| 0.419375 | 6 |
| 0.41989583333333336 | 7 |
| 0.4200347222222222 | 0 |
| 0.4213078703703704 | 7 |
| 0.4230902777777778 | 0 |
| 0.42313657407407407 | 4 |
| 0.4237268518518518 | 1 |
| 0.423738425925926 | 7 |
| 0.4241550925925926 | 5 |
| 0.4247916666666667 | 2 |
| 0.425 | 6 |
| 0.42570601851851847 | 0 |
| 0.4262037037037037 | 1 |
| 0.42721064814814813 | 2 |
| 0.4275925925925926 | 5 |
| 0.4278935185185185 | 3 |
| 0.42791666666666667 | 6 |
| 0.4283796296296296 | 4 |
| 0.4285763888888889 | 7 |
| 0.4302083333333333 | 3 |
| 0.43037037037037035 | 0 |
| 0.43059027777777775 | 4 |
| 0.430775462962963 | 5 |
| 0.43100694444444443 | 1 |
| 0.43202546296296296 | 5 |
| 0.4320833333333333 | 2 |
| 0.433287037037037 | 6 |
| 0.4340046296296296 | 1 |
| 0.4343171296296296 | 2 |
| 0.43432870370370374 | 7 |
| 0.43440972222222224 | 3 |
| 0.4349768518518518 | 6 |
| 0.43568287037037035 | 7 |
| 0.43574074074074076 | 7 |
| 0.4360648148148148 | 4 |
| 0.4363194444444445 | 0 |
| 0.43643518518518515 | 5 |
| 0.43753472222222217 | 3 |
| 0.4379166666666667 | 4 |
| 0.43810185185185185 | 5 |
| 0.4389351851851852 | 0 |
| 0.4394097222222222 | 0 |
| 0.44009259259259265 | 6 |
| 0.440625 | 6 |
| 0.441712962962963 | 1 |
| 0.4430439814814815 | 7 |
| 0.4437962962962963 | 7 |
| 0.4446527777777778 | 2 |
| 0.44472222222222224 | 0 |
| 0.4447453703703704 | 1 |
| 0.4450578703703704 | 2 |
| 0.44515046296296296 | 3 |
| 0.4459490740740741 | 1 |
| 0.4463078703703704 | 0 |
| 0.4468287037037037 | 4 |
| 0.4471990740740741 | 5 |
| 0.44788194444444446 | 3 |
| 0.4481597222222222 | 2 |
| 0.4488773148148148 | 4 |
| 0.4500694444444444 | 1 |
| 0.45067129629629626 | 3 |
| 0.4509027777777778 | 6 |
| 0.45310185185185187 | 4 |
| 0.45319444444444446 | 2 |
| 0.45333333333333337 | 3 |
| 0.45336805555555554 | 1 |
| 0.4535648148148148 | 5 |
| 0.45416666666666666 | 6 |
| 0.454537037037037 | 4 |
| 0.4546527777777778 | 5 |
| 0.45466435185185183 | 7 |
| 0.45476851851851857 | 6 |
| 0.45560185185185187 | 2 |
| 0.45560185185185187 | 0 |
| 0.45690972222222226 | 7 |
| 0.4570023148148148 | 0 |
| 0.45812499999999995 | 3 |
| 0.45834490740740735 | 5 |
| 0.45921296296296293 | 6 |
| 0.4592476851851852 | 7 |
| 0.46015046296296297 | 1 |
| 0.460162037037037 | 0 |
| 0.4603587962962963 | 1 |
| 0.46056712962962965 | 4 |
| 0.46097222222222217 | 2 |
| 0.4610300925925926 | 1 |
| 0.4610416666666666 | 5 |
| 0.46164351851851854 | 6 |
| 0.4618518518518519 | 3 |
| 0.46253472222222225 | 4 |
| 0.4625462962962963 | 2 |
| 0.4628587962962963 | 7 |
| 0.4642013888888889 | 2 |
| 0.46424768518518517 | 5 |
| 0.4643402777777778 | 3 |
| 0.46440972222222227 | 7 |
| 0.46449074074074076 | 0 |
| 0.4646875 | 0 |
| 0.46533564814814815 | 1 |
| 0.46568287037037037 | 5 |
| 0.465787037037037 | 6 |
| 0.4660300925925926 | 3 |
| 0.4664236111111111 | 2 |
| 0.46748842592592593 | 6 |
| 0.46752314814814816 | 7 |
| 0.467662037037037 | 1 |
| 0.4688310185185185 | 4 |
| 0.46917824074074077 | 5 |
| 0.4698032407407407 | 0 |
| 0.47006944444444443 | 2 |
| 0.47033564814814816 | 7 |
| 0.4712731481481482 | 0 |
| 0.4714583333333333 | 1 |
| 0.47184027777777776 | 1 |
| 0.4719907407407407 | 3 |
| 0.4720949074074074 | 2 |
| 0.47238425925925925 | 4 |
| 0.47256944444444443 | 5 |
| 0.47261574074074075 | 6 |
| 0.47297453703703707 | 3 |
| 0.47348379629629633 | 7 |
| 0.47349537037037037 | 2 |
| 0.47358796296296296 | 3 |
| 0.47366898148148145 | 4 |
| 0.4740162037037037 | 3 |
| 0.4746527777777778 | 0 |
| 0.4750925925925926 | 1 |
| 0.47513888888888883 | 6 |
| 0.4752083333333333 | 2 |
| 0.47532407407407407 | 4 |
| 0.4753472222222222 | 3 |
| 0.47540509259259256 | 5 |
| 0.4758680555555555 | 5 |
| 0.4759953703703704 | 4 |
| 0.47640046296296296 | 4 |
| 0.47674768518518523 | 5 |
| 0.47694444444444445 | 5 |
| 0.47760416666666666 | 7 |
| 0.47776620370370365 | 6 |
| 0.47869212962962965 | 6 |
| 0.4787268518518519 | 7 |
| 0.47880787037037037 | 6 |
| 0.4790277777777778 | 7 |
| 0.48020833333333335 | 6 |
| 0.48068287037037033 | 0 |
| 0.4809375 | 0 |
| 0.48104166666666665 | 0 |
| 0.48108796296296297 | 7 |
| 0.48225694444444445 | 0 |
| 0.48269675925925926 | 1 |
| 0.48282407407407407 | 2 |
| 0.48295138888888894 | 3 |
| 0.4831018518518519 | 1 |
| 0.48361111111111116 | 1 |
| 0.48361111111111116 | 4 |
| 0.48369212962962965 | 7 |
| 0.48374999999999996 | 0 |
| 0.48416666666666663 | 1 |
| 0.48457175925925927 | 5 |
| 0.4847916666666667 | 2 |
| 0.4853240740740741 | 3 |
| 0.48541666666666666 | 2 |
| 0.4864351851851852 | 3 |
| 0.4864351851851852 | 6 |
| 0.4866435185185185 | 4 |
| 0.4871990740740741 | 5 |
| 0.4881365740740741 | 1 |
| 0.4891319444444444 | 6 |
| 0.48973379629629626 | 4 |
| 0.4902546296296297 | 5 |
| 0.49040509259259263 | 7 |
| 0.49041666666666667 | 2 |
| 0.4913541666666667 | 7 |
| 0.491412037037037 | 0 |
| 0.4918402777777778 | 1 |
| 0.4920717592592592 | 0 |
| 0.4929861111111111 | 3 |
| 0.49309027777777775 | 2 |
| 0.49356481481481485 | 2 |
| 0.4941203703703703 | 3 |
| 0.49453703703703705 | 6 |
| 0.49504629629629626 | 1 |
| 0.49547453703703703 | 4 |
| 0.49596064814814816 | 5 |
| 0.49657407407407406 | 6 |
| 0.497037037037037 | 7 |
| 0.4971990740740741 | 3 |
| 0.49743055555555554 | 4 |
| 0.49756944444444445 | 0 |
| 0.49796296296296294 | 5 |
| 0.49931712962962965 | 4 |
| 0.49939814814814815 | 7 |
| 0.4994791666666667 | 0 |
| 0.500011574074074 | 5 |
| 0.5001967592592592 | 1 |
| 0.5020023148148148 | 2 |
| 0.5021296296296297 | 6 |
| 0.5022685185185185 | 6 |
| 0.5022916666666667 | 7 |
| 0.5027199074074075 | 1 |
| 0.5047800925925926 | 7 |
| 0.5051388888888889 | 2 |
| 0.5051736111111111 | 2 |
| 0.5053124999999999 | 0 |
| 0.505625 | 0 |
| 0.5076851851851852 | 1 |
| 0.507962962962963 | 1 |
| 0.5087615740740741 | 3 |
| 0.5088310185185185 | 3 |
| 0.5093865740740741 | 3 |
| 0.5097685185185185 | 2 |
| 0.5109259259259259 | 4 |
| 0.5109606481481481 | 5 |
| 0.5109837962962963 | 4 |
| 0.5114814814814815 | 6 |
| 0.5116203703703703 | 4 |
| 0.5116898148148148 | 5 |
| 0.5119791666666667 | 5 |
| 0.512962962962963 | 2 |
| 0.5138310185185185 | 6 |
| 0.5139699074074074 | 7 |
| 0.5140046296296296 | 7 |
| 0.5155092592592593 | 6 |
| 0.516076388888889 | 0 |
| 0.5162847222222222 | 3 |
| 0.5164004629629629 | 7 |
| 0.5171990740740741 | 3 |
| 0.5173726851851852 | 0 |
| 0.5176041666666666 | 0 |
| 0.5176851851851852 | 1 |
| 0.5180092592592592 | 4 |
| 0.5180439814814815 | 1 |
| 0.5181712962962963 | 2 |
| 0.5183101851851851 | 3 |
| 0.5183449074074075 | 5 |
| 0.5187615740740741 | 4 |
| 0.5187962962962963 | 5 |
| 0.5189814814814815 | 4 |
| 0.5193287037037037 | 6 |
| 0.5194675925925926 | 1 |
| 0.5194791666666666 | 2 |
| 0.5196875 | 3 |
| 0.5199537037037038 | 5 |
| 0.520162037037037 | 6 |
| 0.5209027777777778 | 7 |
| 0.5218287037037037 | 7 |
| 0.5218634259259259 | 6 |
| 0.5239467592592593 | 0 |
| 0.5243055555555556 | 4 |
| 0.5248263888888889 | 2 |
| 0.5250462962962963 | 0 |
| 0.5255555555555556 | 1 |
| 0.5259837962962963 | 5 |
| 0.526875 | 7 |
| 0.5269328703703704 | 0 |
| 0.5273611111111111 | 1 |
| 0.5273611111111111 | 2 |
| 0.5275578703703704 | 1 |
| 0.5275694444444444 | 3 |
| 0.5278125 | 2 |
| 0.5281828703703704 | 3 |
| 0.5286458333333334 | 2 |
| 0.5295601851851852 | 3 |
| 0.5296875 | 3 |
| 0.5299421296296296 | 4 |
| 0.5302777777777777 | 5 |
| 0.5313657407407407 | 4 |
| 0.5315393518518519 | 5 |
| 0.5318055555555555 | 6 |
| 0.531875 | 7 |
| 0.5320601851851852 | 0 |
| 0.5321296296296296 | 6 |
| 0.5322222222222223 | 4 |
| 0.5324305555555556 | 1 |
| 0.5328703703703704 | 7 |
| 0.5330555555555555 | 6 |
| 0.5330787037037037 | 4 |
| 0.5335185185185185 | 2 |
| 0.5336111111111111 | 5 |
| 0.533912037037037 | 5 |
| 0.5354050925925926 | 7 |
| 0.5357407407407407 | 0 |
| 0.5361574074074075 | 1 |
| 0.5369907407407407 | 3 |
| 0.5370717592592592 | 0 |
| 0.5379976851851852 | 6 |
| 0.5391203703703703 | 4 |
| 0.5396296296296296 | 1 |
| 0.5398842592592593 | 2 |
| 0.5404050925925926 | 5 |
| 0.5405671296296296 | 7 |
| 0.5410300925925926 | 6 |
| 0.5411111111111111 | 0 |
| 0.5412384259259259 | 2 |
| 0.5416550925925926 | 3 |
| 0.542974537037037 | 6 |
| 0.5433912037037038 | 7 |
| 0.5434837962962963 | 4 |
| 0.5436574074074074 | 5 |
| 0.5437268518518519 | 0 |
| 0.5438194444444444 | 1 |
| 0.5439236111111111 | 6 |
| 0.5439930555555555 | 7 |
| 0.5441435185185185 | 1 |
| 0.5442013888888889 | 0 |
| 0.5445717592592593 | 1 |
| 0.5446643518518518 | 3 |
| 0.5447453703703703 | 4 |
| 0.5456597222222223 | 2 |
| 0.5456712962962963 | 2 |
| 0.5460763888888889 | 7 |
| 0.5464814814814815 | 0 |
| 0.547511574074074 | 1 |
| 0.5484027777777778 | 5 |
| 0.5491898148148148 | 3 |
| 0.5492592592592592 | 2 |
| 0.549537037037037 | 2 |
| 0.5513541666666667 | 4 |
| 0.5516666666666666 | 3 |
| 0.5516898148148148 | 6 |
| 0.5521180555555555 | 7 |
| 0.5526504629629629 | 5 |
| 0.5527083333333334 | 3 |
| 0.5527893518518519 | 4 |
| 0.5532407407407408 | 3 |
| 0.5532986111111111 | 0 |
| 0.5538078703703704 | 4 |
| 0.5538194444444444 | 5 |
| 0.5539814814814815 | 6 |
| 0.5541550925925925 | 7 |
| 0.5547337962962963 | 1 |
| 0.5548263888888889 | 4 |
| 0.5548611111111111 | 5 |
| 0.5552662037037037 | 6 |
| 0.5553935185185185 | 6 |
| 0.5554513888888889 | 0 |
| 0.5564699074074074 | 5 |
| 0.5564814814814815 | 1 |
| 0.5566666666666666 | 2 |
| 0.5579513888888888 | 7 |
| 0.5584027777777778 | 7 |
| 0.5586805555555555 | 3 |
| 0.5588194444444444 | 0 |
| 0.559224537037037 | 4 |
| 0.5595138888888889 | 5 |
| 0.5597800925925925 | 6 |
| 0.5598611111111111 | 1 |
| 0.5599652777777778 | 2 |
| 0.5601157407407408 | 0 |
| 0.5602083333333333 | 7 |
| 0.561400462962963 | 0 |
| 0.5617592592592593 | 1 |
| 0.5619212962962963 | 2 |
| 0.5623611111111111 | 6 |
| 0.5628356481481481 | 1 |
| 0.563599537037037 | 2 |
| 0.5638194444444444 | 3 |
| 0.5640740740740741 | 3 |
| 0.5647800925925927 | 2 |
| 0.56625 | 4 |
| 0.5662615740740741 | 5 |
| 0.5664236111111111 | 6 |
| 0.5665972222222222 | 7 |
| 0.5668055555555556 | 3 |
| 0.5668981481481482 | 7 |
| 0.5673611111111111 | 4 |
| 0.5674421296296296 | 0 |
| 0.567650462962963 | 5 |
| 0.5679166666666667 | 0 |
| 0.5685532407407408 | 4 |
| 0.5689699074074074 | 1 |
| 0.5697106481481481 | 3 |
| 0.5702777777777778 | 5 |
| 0.5705092592592592 | 6 |
| 0.572037037037037 | 1 |
| 0.5721643518518519 | 2 |
| 0.5724884259259259 | 2 |
| 0.5725810185185185 | 4 |
| 0.5729050925925926 | 3 |
| 0.5749768518518519 | 4 |
| 0.5750810185185186 | 7 |
| 0.5756249999999999 | 0 |
| 0.5775347222222222 | 6 |
| 0.5780787037037037 | 5 |
| 0.5785648148148148 | 6 |
| 0.5791550925925926 | 7 |
| 0.5799421296296297 | 7 |
| 0.5802546296296297 | 1 |
| 0.5802893518518518 | 0 |
| 0.5803703703703703 | 2 |
| 0.5807175925925926 | 1 |
| 0.5811226851851852 | 3 |
| 0.5821180555555555 | 5 |
| 0.5823842592592593 | 3 |
| 0.5832060185185185 | 4 |
| 0.5848842592592592 | 6 |
| 0.5849189814814815 | 7 |
| 0.5852893518518518 | 4 |
| 0.585324074074074 | 0 |
| 0.5859375 | 2 |
| 0.5862962962962963 | 1 |
| 0.5863310185185185 | 5 |
| 0.5868171296296296 | 6 |
| 0.5874074074074074 | 7 |
| 0.5878819444444444 | 2 |
| 0.5894444444444444 | 3 |
| 0.5895254629629629 | 4 |
| 0.5897222222222221 | 3 |
| 0.5909375 | 0 |
| 0.5911921296296296 | 4 |
| 0.5912268518518519 | 5 |
| 0.5914236111111111 | 6 |
| 0.5920833333333334 | 7 |
| 0.5923842592592593 | 1 |
| 0.593287037037037 | 5 |
| 0.5933796296296296 | 2 |
| 0.5936226851851852 | 0 |
| 0.5939351851851852 | 0 |
| 0.5939814814814816 | 3 |
| 0.5945949074074074 | 1 |
| 0.5949652777777777 | 5 |
| 0.5955324074074074 | 1 |
| 0.5960416666666667 | 4 |
| 0.5961921296296296 | 2 |
| 0.5966666666666667 | 6 |
| 0.5970949074074073 | 7 |
| 0.5974305555555556 | 5 |
| 0.597650462962963 | 2 |
| 0.5977662037037037 | 6 |
| 0.5978125 | 7 |
| 0.5980324074074074 | 3 |
| 0.5983101851851852 | 0 |
| 0.5995138888888889 | 4 |
| 0.5995601851851852 | 5 |
| 0.5997337962962963 | 6 |
| 0.5997569444444445 | 6 |
| 0.5997800925925926 | 1 |
| 0.5999537037037037 | 7 |
| 0.6004166666666667 | 7 |
| 0.6017592592592592 | 2 |
| 0.6019560185185185 | 3 |
| 0.6022800925925926 | 0 |
| 0.6038310185185185 | 3 |
| 0.6038541666666667 | 0 |
| 0.6038888888888889 | 1 |
| 0.6039120370370371 | 0 |
| 0.604386574074074 | 4 |
| 0.6046874999999999 | 5 |
| 0.6053819444444445 | 1 |
| 0.6059953703703703 | 4 |
| 0.6060185185185185 | 2 |
| 0.6063888888888889 | 2 |
| 0.606574074074074 | 5 |
| 0.6069907407407408 | 1 |
| 0.6069907407407408 | 3 |
| 0.6072916666666667 | 2 |
| 0.6076041666666666 | 6 |
| 0.6090856481481481 | 4 |
| 0.6099305555555555 | 6 |
| 0.6101041666666667 | 3 |
| 0.6103472222222223 | 3 |
| 0.6104976851851852 | 5 |
| 0.610775462962963 | 7 |
| 0.6120601851851851 | 4 |
| 0.6122685185185185 | 7 |
| 0.612650462962963 | 0 |
| 0.6128240740740741 | 0 |
| 0.6128356481481482 | 6 |
| 0.6128472222222222 | 1 |
| 0.6130555555555556 | 7 |
| 0.614375 | 5 |
| 0.6144097222222222 | 4 |
| 0.615 | 5 |
| 0.6151504629629629 | 6 |
| 0.61625 | 7 |
| 0.6170138888888889 | 0 |
| 0.6175462962962963 | 1 |
| 0.617662037037037 | 2 |
| 0.6181134259259259 | 0 |
| 0.6183796296296297 | 6 |
| 0.6184375 | 3 |
| 0.6192245370370371 | 7 |
| 0.6201851851851852 | 1 |
| 0.6203009259259259 | 2 |
| 0.6205092592592593 | 2 |
| 0.6205555555555555 | 4 |
| 0.6211111111111111 | 0 |
| 0.6213078703703704 | 1 |
| 0.6233564814814815 | 3 |
| 0.6237384259259259 | 5 |
| 0.6242476851851851 | 6 |
| 0.624849537037037 | 7 |
| 0.6248611111111111 | 3 |
| 0.6253356481481481 | 4 |
| 0.6255208333333333 | 4 |
| 0.6257060185185185 | 1 |
| 0.6260532407407408 | 2 |
| 0.6269444444444444 | 5 |
| 0.6273611111111111 | 6 |
| 0.6276851851851851 | 5 |
| 0.6284722222222222 | 6 |
| 0.6288078703703703 | 2 |
| 0.6294212962962963 | 7 |
| 0.6295833333333333 | 7 |
| 0.6298842592592593 | 3 |
| 0.6311805555555555 | 0 |
| 0.6314814814814814 | 0 |
| 0.6315393518518518 | 4 |
| 0.632025462962963 | 5 |
| 0.632175925925926 | 1 |
| 0.6328125 | 6 |
| 0.632824074074074 | 0 |
| 0.633125 | 7 |
| 0.6333912037037037 | 3 |
| 0.6337962962962963 | 2 |
| 0.6339236111111112 | 1 |
| 0.6340509259259259 | 4 |
| 0.6348379629629629 | 2 |
| 0.6354976851851851 | 5 |
| 0.6356828703703704 | 3 |
| 0.6359143518518519 | 6 |
| 0.636099537037037 | 3 |
| 0.6366898148148148 | 0 |
| 0.6371990740740741 | 4 |
| 0.6372337962962963 | 5 |
| 0.6374421296296297 | 6 |
| 0.637974537037037 | 7 |
| 0.6381018518518519 | 7 |
| 0.6383101851851852 | 4 |
| 0.6391782407407408 | 1 |
| 0.639525462962963 | 2 |
| 0.640011574074074 | 0 |
| 0.6414004629629629 | 0 |
| 0.6415046296296296 | 1 |
| 0.6416550925925926 | 1 |
| 0.642511574074074 | 1 |
| 0.6430439814814815 | 5 |
| 0.6434143518518519 | 3 |
| 0.643425925925926 | 2 |
| 0.6438310185185185 | 2 |
| 0.6442245370370371 | 2 |
| 0.644699074074074 | 3 |
| 0.6450925925925927 | 4 |
| 0.6452430555555556 | 3 |
| 0.6455902777777778 | 5 |
| 0.6459837962962963 | 4 |
| 0.6463773148148148 | 6 |
| 0.646701388888889 | 7 |
| 0.6469328703703704 | 4 |
| 0.6481712962962963 | 5 |
| 0.6482407407407408 | 3 |
| 0.6494791666666667 | 6 |
| 0.6503240740740741 | 0 |
| 0.6511574074074075 | 6 |
| 0.6513194444444445 | 7 |
| 0.6516898148148148 | 5 |
| 0.6523958333333334 | 4 |
| 0.6529861111111112 | 5 |
| 0.6536226851851852 | 7 |
| 0.6539699074074073 | 0 |
| 0.6542708333333334 | 0 |
| 0.6549652777777778 | 1 |
| 0.6552083333333333 | 1 |
| 0.6564351851851852 | 6 |
| 0.6566087962962963 | 2 |
| 0.656863425925926 | 3 |
| 0.6573032407407408 | 7 |
| 0.6577662037037036 | 1 |
| 0.6579398148148148 | 2 |
| 0.657962962962963 | 2 |
| 0.6589930555555555 | 3 |
| 0.6590856481481482 | 3 |
| 0.659224537037037 | 0 |
| 0.6594212962962963 | 1 |
| 0.6597453703703704 | 4 |
| 0.6598611111111111 | 6 |
| 0.6600231481481481 | 7 |
| 0.6600925925925926 | 4 |
| 0.6619328703703703 | 6 |
| 0.6619560185185185 | 5 |
| 0.6621064814814815 | 7 |
| 0.6629050925925926 | 0 |
| 0.6629861111111112 | 0 |
| 0.6632870370370371 | 6 |
| 0.6636805555555555 | 1 |
| 0.6651041666666667 | 1 |
| 0.6653356481481482 | 5 |
| 0.6653356481481482 | 2 |
| 0.6656018518518518 | 3 |
| 0.6656481481481481 | 2 |
| 0.6660648148148148 | 6 |
| 0.6660763888888889 | 3 |
| 0.6670833333333334 | 2 |
| 0.6674884259259258 | 7 |
| 0.6678472222222221 | 0 |
| 0.6678819444444444 | 4 |
| 0.6681944444444444 | 7 |
| 0.6688310185185186 | 4 |
| 0.6704629629629629 | 5 |
| 0.6706828703703703 | 5 |
| 0.6706944444444445 | 6 |
| 0.6708680555555556 | 7 |
| 0.6713425925925925 | 6 |
| 0.6716666666666667 | 0 |
| 0.6717013888888889 | 1 |
| 0.6717592592592593 | 3 |
| 0.671875 | 2 |
| 0.6722685185185185 | 0 |
| 0.6724305555555555 | 4 |
| 0.6730439814814816 | 3 |
| 0.6738888888888889 | 1 |
| 0.6739004629629629 | 5 |
| 0.6743287037037037 | 6 |
| 0.6744328703703704 | 2 |
| 0.674861111111111 | 3 |
| 0.6755671296296296 | 7 |
| 0.6759143518518518 | 4 |
| 0.6760185185185185 | 0 |
| 0.6764351851851852 | 7 |
| 0.6764351851851852 | 1 |
| 0.6765046296296297 | 2 |
| 0.6766782407407407 | 4 |
| 0.6774074074074075 | 3 |
| 0.6786574074074073 | 4 |
| 0.6789814814814815 | 5 |
| 0.6792824074074074 | 5 |
| 0.679375 | 5 |
| 0.6795717592592593 | 1 |
| 0.6799189814814816 | 0 |
| 0.6800462962962963 | 6 |
| 0.6801157407407407 | 6 |
| 0.680162037037037 | 6 |
| 0.6805787037037038 | 7 |
| 0.6810532407407407 | 1 |
| 0.6818749999999999 | 0 |
| 0.6819907407407407 | 2 |
| 0.6822800925925926 | 7 |
| 0.683287037037037 | 3 |
| 0.6835416666666667 | 2 |
| 0.6844097222222222 | 7 |
| 0.6848611111111111 | 0 |
| 0.6855671296296296 | 4 |
| 0.6856481481481481 | 3 |
| 0.6858564814814815 | 1 |
| 0.6864120370370371 | 0 |
| 0.6879282407407407 | 2 |
| 0.6882291666666666 | 4 |
| 0.6884375 | 1 |
| 0.689212962962963 | 5 |
| 0.6897222222222222 | 6 |
| 0.6904166666666667 | 5 |
| 0.6906365740740741 | 1 |
| 0.6907060185185184 | 2 |
| 0.691099537037037 | 3 |
| 0.6913773148148148 | 4 |
| 0.6916203703703704 | 3 |
| 0.6921064814814816 | 5 |
| 0.6924305555555555 | 2 |
| 0.6928935185185185 | 4 |
| 0.6932175925925925 | 5 |
| 0.6937847222222223 | 7 |
| 0.6942939814814815 | 6 |
| 0.6945486111111111 | 3 |
| 0.6948263888888889 | 0 |
| 0.694837962962963 | 7 |
| 0.6950810185185184 | 1 |
| 0.6959953703703704 | 2 |
| 0.6961458333333334 | 0 |
| 0.6971527777777777 | 4 |
| 0.697650462962963 | 6 |
| 0.6980787037037036 | 3 |
| 0.698136574074074 | 5 |
| 0.6986458333333333 | 6 |
| 0.69875 | 6 |
| 0.698912037037037 | 7 |
| 0.6994444444444444 | 4 |
| 0.7001967592592592 | 1 |
| 0.7004282407407407 | 7 |
| 0.7009375000000001 | 0 |
| 0.7019444444444445 | 0 |
| 0.7019907407407407 | 5 |
| 0.7020370370370371 | 6 |
| 0.7023032407407408 | 2 |
| 0.702650462962963 | 1 |
| 0.7027430555555556 | 7 |
| 0.7037847222222222 | 0 |
| 0.7040393518518518 | 1 |
| 0.7043402777777777 | 2 |
| 0.7046064814814814 | 3 |
| 0.7047453703703703 | 1 |
| 0.7049652777777777 | 2 |
| 0.705011574074074 | 2 |
| 0.7055092592592592 | 3 |
| 0.705787037037037 | 4 |
| 0.7062268518518519 | 7 |
| 0.7065277777777778 | 5 |
| 0.7066782407407407 | 3 |
| 0.7070486111111111 | 3 |
| 0.7073726851851853 | 0 |
| 0.7079050925925926 | 4 |
| 0.708287037037037 | 1 |
| 0.7084259259259259 | 4 |
| 0.7088425925925925 | 4 |
| 0.7097916666666667 | 5 |
| 0.7098148148148148 | 6 |
| 0.7099768518518519 | 7 |
| 0.7101273148148147 | 5 |
| 0.7107986111111111 | 0 |
| 0.7109953703703704 | 5 |
| 0.7110416666666667 | 6 |
| 0.7121527777777777 | 6 |
| 0.712199074074074 | 6 |
| 0.7127199074074074 | 2 |
| 0.7128356481481481 | 3 |
| 0.7130671296296297 | 1 |
| 0.7136111111111111 | 2 |
| 0.7140509259259259 | 3 |
| 0.7149652777777779 | 7 |
| 0.7152546296296296 | 7 |
| 0.7154861111111112 | 0 |
| 0.7159143518518518 | 4 |
| 0.716412037037037 | 0 |
| 0.7168981481481481 | 7 |
| 0.7173263888888889 | 1 |
| 0.7185648148148148 | 5 |
| 0.7193518518518518 | 1 |
| 0.7194675925925926 | 6 |
| 0.7195717592592592 | 4 |
| 0.7196180555555555 | 2 |
| 0.7202662037037038 | 5 |
| 0.7211574074074073 | 0 |
| 0.7213078703703704 | 3 |
| 0.721412037037037 | 6 |
| 0.7217939814814814 | 2 |
| 0.7218981481481482 | 3 |
| 0.7229282407407407 | 1 |
| 0.7235069444444444 | 4 |
| 0.7237962962962964 | 7 |
| 0.7241435185185185 | 2 |
| 0.7242592592592593 | 0 |
| 0.7248148148148149 | 5 |
| 0.7251157407407408 | 7 |
| 0.7265162037037037 | 3 |
| 0.7269097222222222 | 6 |
| 0.7275 | 0 |
| 0.7279166666666667 | 1 |
| 0.7286458333333333 | 4 |
| 0.7286805555555556 | 4 |
| 0.729375 | 5 |
| 0.7297106481481482 | 1 |
| 0.7303935185185185 | 2 |
| 0.7304050925925926 | 5 |
| 0.7305324074074074 | 6 |
| 0.7306134259259259 | 3 |
| 0.730775462962963 | 6 |
| 0.7316319444444445 | 4 |
| 0.7316782407407407 | 7 |
| 0.7319097222222223 | 7 |
| 0.7319907407407408 | 2 |
| 0.7327893518518519 | 0 |
| 0.7334606481481482 | 5 |
| 0.7341435185185184 | 3 |
| 0.7342592592592593 | 7 |
| 0.7345254629629631 | 6 |
| 0.7350462962962964 | 1 |
| 0.7359953703703703 | 0 |
| 0.7366550925925925 | 0 |
| 0.7367939814814815 | 4 |
| 0.7377662037037037 | 2 |
| 0.7377893518518519 | 1 |
| 0.7378009259259258 | 5 |
| 0.7383101851851852 | 3 |
| 0.7383217592592594 | 6 |
| 0.7386342592592593 | 7 |
| 0.7387615740740742 | 4 |
| 0.7388078703703704 | 5 |
| 0.7388773148148148 | 1 |
| 0.7390277777777778 | 2 |
| 0.7395601851851853 | 2 |
| 0.7397916666666666 | 3 |
| 0.7408217592592593 | 4 |
| 0.7414351851851851 | 3 |
| 0.7421412037037037 | 0 |
| 0.7423263888888889 | 1 |
| 0.7425 | 7 |
| 0.7426273148148148 | 6 |
| 0.742650462962963 | 5 |
| 0.7427662037037037 | 2 |
| 0.7435648148148148 | 0 |
| 0.7435995370370371 | 4 |
| 0.7437268518518518 | 6 |
| 0.7438310185185185 | 1 |
| 0.7447685185185186 | 2 |
| 0.7453819444444445 | 5 |
| 0.7457523148148147 | 6 |
| 0.7468750000000001 | 7 |
| 0.7468981481481481 | 3 |
| 0.7469097222222222 | 7 |
| 0.747800925925926 | 0 |
| 0.7478587962962964 | 7 |
| 0.7482986111111112 | 4 |
| 0.7490740740740741 | 0 |
| 0.7495138888888889 | 1 |
| 0.7500925925925926 | 1 |
| 0.7509259259259259 | 5 |
| 0.7509722222222223 | 6 |
| 0.7512384259259259 | 2 |
| 0.751388888888889 | 0 |
| 0.7515740740740741 | 1 |
| 0.7520138888888889 | 2 |
| 0.7525231481481481 | 3 |
| 0.7528356481481482 | 2 |
| 0.7530439814814814 | 4 |
| 0.7534027777777778 | 3 |
| 0.7536689814814815 | 3 |
| 0.7538425925925926 | 4 |
| 0.7538541666666667 | 4 |
| 0.753900462962963 | 5 |
| 0.7539351851851852 | 5 |
| 0.7552777777777777 | 7 |
| 0.7553819444444444 | 6 |
| 0.7564467592592593 | 0 |
| 0.7573842592592593 | 1 |
| 0.7577777777777778 | 6 |
| 0.7579398148148148 | 7 |
| 0.7598148148148148 | 0 |
| 0.7607870370370371 | 5 |
| 0.7608796296296297 | 1 |
| 0.7618287037037037 | 3 |
| 0.7619328703703704 | 2 |
| 0.7620601851851853 | 3 |
| 0.7620833333333333 | 7 |
| 0.7623611111111112 | 4 |
| 0.7632523148148148 | 5 |
| 0.7637037037037038 | 2 |
| 0.764236111111111 | 3 |
| 0.7643055555555556 | 0 |
| 0.7647106481481482 | 6 |
| 0.7647569444444445 | 1 |
| 0.7653125 | 6 |
| 0.7659027777777778 | 4 |
| 0.7665162037037038 | 2 |
| 0.7672800925925927 | 7 |
| 0.7676736111111112 | 7 |
| 0.7687962962962963 | 5 |
| 0.7691550925925926 | 4 |
| 0.7691666666666667 | 0 |
| 0.7696875 | 5 |
| 0.7700231481481481 | 6 |
| 0.7702430555555555 | 1 |
| 0.7703240740740741 | 0 |
| 0.7708564814814814 | 6 |
| 0.7714351851851852 | 1 |
| 0.7730787037037037 | 2 |
| 0.7734375 | 7 |
| 0.7735532407407407 | 0 |
| 0.7736111111111111 | 3 |
| 0.7746412037037037 | 2 |
| 0.7746643518518518 | 7 |
| 0.7751273148148149 | 3 |
| 0.7753009259259259 | 4 |
| 0.7753125000000001 | 1 |
| 0.7761921296296297 | 5 |
| 0.7770138888888889 | 2 |
| 0.7771064814814815 | 0 |
| 0.7777546296296296 | 4 |
| 0.7778240740740742 | 3 |
| 0.7782060185185186 | 5 |
| 0.7783449074074075 | 5 |
| 0.7787962962962963 | 6 |
| 0.7793749999999999 | 1 |
| 0.7794328703703703 | 6 |
| 0.7798726851851852 | 7 |
| 0.7800810185185186 | 2 |
| 0.780300925925926 | 3 |
| 0.780787037037037 | 6 |
| 0.7813541666666667 | 4 |
| 0.7817824074074075 | 0 |
| 0.7823148148148148 | 1 |
| 0.7828703703703703 | 7 |
| 0.7829861111111112 | 0 |
| 0.7831828703703704 | 7 |
| 0.7832291666666666 | 5 |
| 0.783912037037037 | 4 |
| 0.7843171296296297 | 6 |
| 0.7847569444444445 | 1 |
| 0.7856134259259259 | 2 |
| 0.7858680555555555 | 0 |
| 0.7861921296296296 | 3 |
| 0.7864699074074074 | 2 |
| 0.7869907407407407 | 1 |
| 0.7872916666666666 | 3 |
| 0.7883449074074074 | 4 |
| 0.7885416666666667 | 7 |
| 0.7901736111111112 | 5 |
| 0.7901967592592593 | 6 |
| 0.7902546296296297 | 2 |
| 0.7907291666666666 | 3 |
| 0.7921412037037037 | 0 |
| 0.7921874999999999 | 7 |
| 0.7923263888888888 | 1 |
| 0.7927777777777778 | 2 |
| 0.7931365740740741 | 5 |
| 0.7932407407407407 | 6 |
| 0.7934027777777778 | 4 |
| 0.7934143518518518 | 4 |
| 0.7937152777777778 | 0 |
| 0.7940046296296296 | 5 |
| 0.7944212962962963 | 7 |
| 0.7944675925925927 | 6 |
| 0.7955439814814814 | 0 |
| 0.7955555555555556 | 7 |
| 0.7975 | 0 |
| 0.7980208333333333 | 1 |
| 0.7997106481481482 | 5 |
| 0.7997337962962963 | 6 |
| 0.8012615740740742 | 1 |
| 0.8013657407407407 | 2 |
| 0.8017361111111111 | 7 |
| 0.8019675925925926 | 3 |
| 0.8020949074074074 | 2 |
| 0.8027893518518519 | 3 |
| 0.802962962962963 | 1 |
| 0.8032754629629629 | 0 |
| 0.8033333333333333 | 4 |
| 0.8036226851851852 | 2 |
| 0.8038657407407408 | 3 |
| 0.8040972222222221 | 4 |
| 0.8041435185185185 | 4 |
| 0.8042476851851852 | 5 |
| 0.8057291666666666 | 6 |
| 0.8078587962962963 | 3 |
| 0.8079398148148148 | 5 |
| 0.8083564814814815 | 7 |
| 0.8090046296296296 | 5 |
| 0.8091087962962963 | 6 |
| 0.8096180555555555 | 4 |
| 0.8096412037037037 | 5 |
| 0.8102893518518518 | 0 |
| 0.8103125000000001 | 7 |
| 0.8104629629629629 | 6 |
| 0.8108680555555555 | 1 |
| 0.8113773148148148 | 1 |
| 0.8114467592592592 | 0 |
| 0.8117013888888889 | 2 |
| 0.8117592592592593 | 6 |
| 0.8134837962962963 | 3 |
| 0.813888888888889 | 7 |
| 0.8142708333333334 | 2 |
| 0.8147222222222222 | 0 |
| 0.8148148148148149 | 3 |
| 0.8165393518518519 | 4 |
| 0.8175810185185185 | 5 |
| 0.8175925925925926 | 1 |
| 0.817662037037037 | 2 |
| 0.8189699074074074 | 1 |
| 0.8194791666666666 | 3 |
| 0.8195023148148147 | 5 |
| 0.8196412037037036 | 2 |
| 0.8201273148148148 | 6 |
| 0.820763888888889 | 6 |
| 0.8235648148148148 | 7 |
| 0.8239351851851852 | 3 |
| 0.8242708333333333 | 7 |
| 0.8243865740740741 | 0 |
| 0.8244097222222222 | 0 |
| 0.8256828703703704 | 4 |
| 0.8257175925925927 | 4 |
| 0.8257523148148148 | 5 |
| 0.8261805555555556 | 1 |
| 0.8267824074074074 | 5 |
| 0.8273032407407408 | 1 |
| 0.8273726851851851 | 2 |
| 0.8276273148148148 | 6 |
| 0.8277546296296295 | 0 |
| 0.8278935185185184 | 6 |
| 0.8279398148148148 | 2 |
| 0.8279513888888889 | 7 |
| 0.8280208333333333 | 0 |
| 0.8287731481481481 | 3 |
| 0.829201388888889 | 3 |
| 0.8298842592592592 | 7 |
| 0.8333217592592592 | 1 |
| 0.8350231481481482 | 4 |
| 0.8354398148148148 | 4 |
| 0.836550925925926 | 5 |
| 0.8373842592592592 | 2 |
| 0.8373958333333333 | 6 |
| 0.8377199074074074 | 7 |
| 0.8377893518518519 | 0 |
| 0.8397106481481482 | 3 |
| 0.8400347222222222 | 4 |
| 0.8405092592592592 | 5 |
| 0.8414467592592593 | 5 |
| 0.8414699074074075 | 6 |
| 0.843287037037037 | 6 |
| 0.8435069444444445 | 7 |
| 0.8441087962962963 | 0 |
| 0.8447685185185185 | 7 |
| 0.8450810185185186 | 0 |
| 0.8462037037037037 | 1 |
| 0.8474189814814815 | 2 |
| 0.847662037037037 | 3 |
| 0.8497685185185185 | 1 |
| 0.8499189814814815 | 0 |
| 0.8499652777777778 | 1 |
| 0.8502546296296297 | 4 |
| 0.8505208333333334 | 5 |
| 0.8513657407407407 | 2 |
| 0.851875 | 3 |
| 0.8522222222222222 | 6 |
| 0.8522685185185185 | 7 |
| 0.8525231481481481 | 4 |
| 0.8528356481481482 | 1 |
| 0.8528703703703703 | 0 |
| 0.8536805555555556 | 2 |
| 0.8538888888888888 | 2 |
| 0.8541550925925926 | 5 |
| 0.8544097222222223 | 1 |
| 0.8555092592592594 | 3 |
| 0.8555324074074074 | 6 |
| 0.8557523148148148 | 4 |
| 0.8560879629629629 | 1 |
| 0.8562500000000001 | 3 |
| 0.856574074074074 | 4 |
| 0.8570601851851851 | 5 |
| 0.8573032407407407 | 2 |
| 0.8575462962962962 | 3 |
| 0.8581365740740741 | 2 |
| 0.8593518518518519 | 3 |
| 0.8596875 | 5 |
| 0.8597222222222222 | 7 |
| 0.8598726851851852 | 6 |
| 0.859988425925926 | 4 |
| 0.860162037037037 | 4 |
| 0.8604282407407408 | 5 |
| 0.8606597222222222 | 5 |
| 0.8612500000000001 | 0 |
| 0.8613773148148148 | 7 |
| 0.8621412037037036 | 6 |
| 0.8621875 | 7 |
| 0.8622800925925925 | 6 |
| 0.8627893518518519 | 0 |
| 0.8643402777777777 | 1 |
| 0.865798611111111 | 7 |
| 0.8662962962962962 | 1 |
| 0.8665972222222221 | 0 |
| 0.8666435185185185 | 0 |
| 0.8666550925925925 | 1 |
| 0.8678125 | 2 |
| 0.8680671296296296 | 2 |
| 0.8680902777777778 | 2 |
| 0.8683101851851852 | 6 |
| 0.8685879629629629 | 3 |
| 0.8692361111111112 | 4 |
| 0.8693055555555556 | 3 |
| 0.8695949074074073 | 1 |
| 0.8696412037037037 | 3 |
| 0.869675925925926 | 2 |
| 0.8698148148148147 | 4 |
| 0.8699421296296297 | 4 |
| 0.8703587962962963 | 5 |
| 0.870625 | 5 |
| 0.8709027777777778 | 5 |
| 0.8715393518518518 | 3 |
| 0.8717476851851852 | 6 |
| 0.8722916666666666 | 6 |
| 0.8728819444444444 | 7 |
| 0.8745717592592593 | 0 |
| 0.8747800925925926 | 1 |
| 0.8749884259259259 | 2 |
| 0.875462962962963 | 3 |
| 0.8760879629629629 | 7 |
| 0.876261574074074 | 0 |
| 0.876550925925926 | 7 |
| 0.8775231481481481 | 1 |
| 0.8779050925925925 | 4 |
| 0.8781018518518519 | 0 |
| 0.8783217592592593 | 6 |
| 0.8788541666666667 | 2 |
| 0.8790393518518518 | 5 |
| 0.8798958333333333 | 6 |
| 0.8802314814814814 | 7 |
| 0.8803009259259259 | 0 |
| 0.8804398148148148 | 3 |
| 0.8805555555555555 | 4 |
| 0.8813425925925925 | 5 |
| 0.8832175925925926 | 1 |
| 0.8846296296296297 | 6 |
| 0.8847569444444444 | 2 |
| 0.8851388888888888 | 4 |
| 0.8852083333333334 | 7 |
| 0.8861458333333333 | 7 |
| 0.8863194444444445 | 0 |
| 0.8865972222222221 | 3 |
| 0.8867824074074074 | 4 |
| 0.8871064814814815 | 5 |
| 0.8873263888888889 | 5 |
| 0.8875925925925926 | 1 |
| 0.8877777777777777 | 0 |
| 0.8886342592592592 | 1 |
| 0.888738425925926 | 6 |
| 0.8888425925925926 | 2 |
| 0.8889236111111112 | 2 |
| 0.889548611111111 | 3 |
| 0.8898842592592593 | 7 |
| 0.8899421296296296 | 4 |
| 0.8905208333333333 | 3 |
| 0.8906481481481481 | 4 |
| 0.8907986111111111 | 6 |
| 0.8914351851851853 | 5 |
| 0.8916087962962963 | 0 |
| 0.8918287037037037 | 1 |
| 0.8919328703703703 | 7 |
| 0.8919791666666667 | 5 |
| 0.8920370370370371 | 2 |
| 0.8924652777777777 | 6 |
| 0.8925000000000001 | 3 |
| 0.8926620370370371 | 0 |
| 0.8942708333333332 | 1 |
| 0.8943634259259259 | 7 |
| 0.8947337962962963 | 6 |
| 0.8948611111111111 | 0 |
| 0.8953125000000001 | 7 |
| 0.895625 | 2 |
| 0.8964351851851852 | 1 |
| 0.8979050925925925 | 0 |
| 0.8987615740740741 | 1 |
| 0.8989699074074075 | 1 |
| 0.8989814814814815 | 2 |
| 0.8992476851851853 | 2 |
| 0.8996875000000001 | 3 |
| 0.9000810185185185 | 4 |
| 0.9002083333333334 | 2 |
| 0.9004629629629629 | 3 |
| 0.9007523148148149 | 3 |
| 0.9021296296296296 | 5 |
| 0.9023263888888889 | 4 |
| 0.9026273148148148 | 6 |
| 0.9030208333333333 | 4 |
| 0.9031250000000001 | 4 |
| 0.9033912037037037 | 5 |
| 0.9043287037037038 | 5 |
| 0.904537037037037 | 7 |
| 0.9050231481481482 | 0 |
| 0.905150462962963 | 6 |
| 0.9051967592592592 | 7 |
| 0.9058101851851852 | 0 |
| 0.9066203703703705 | 1 |
| 0.9070138888888889 | 3 |
| 0.9073958333333333 | 1 |
| 0.907511574074074 | 5 |
| 0.9080671296296297 | 6 |
| 0.909212962962963 | 7 |
| 0.9094444444444445 | 2 |
| 0.9099537037037037 | 0 |
| 0.9103240740740741 | 4 |
| 0.910462962962963 | 6 |
| 0.9109606481481481 | 3 |
| 0.9112152777777777 | 2 |
| 0.9114583333333334 | 7 |
| 0.9115856481481481 | 1 |
| 0.9119444444444444 | 5 |
| 0.9124652777777778 | 3 |
| 0.912962962962963 | 2 |
| 0.913113425925926 | 4 |
| 0.9132291666666666 | 4 |
| 0.9137962962962963 | 5 |
| 0.9146875 | 0 |
| 0.9158796296296297 | 1 |
| 0.9177430555555556 | 5 |
| 0.9183564814814815 | 2 |
| 0.9205902777777778 | 6 |
| 0.9207291666666667 | 6 |
| 0.9216550925925926 | 6 |
| 0.9217245370370369 | 7 |
| 0.9228009259259259 | 7 |
| 0.923599537037037 | 0 |
| 0.923599537037037 | 3 |
| 0.9245138888888889 | 3 |
| 0.9249768518518519 | 0 |
| 0.9251967592592593 | 1 |
| 0.9254513888888889 | 2 |
| 0.9261689814814815 | 1 |
| 0.9274074074074075 | 3 |
| 0.9278703703703703 | 4 |
| 0.927962962962963 | 4 |
| 0.9286689814814815 | 2 |
| 0.9295138888888889 | 5 |
| 0.9296412037037037 | 7 |
| 0.9298148148148148 | 0 |
| 0.9311111111111111 | 1 |
| 0.9317361111111112 | 5 |
| 0.9324305555555555 | 4 |
| 0.9324768518518519 | 2 |
| 0.9327546296296297 | 5 |
| 0.9334375 | 6 |
| 0.9336342592592594 | 7 |
| 0.9338541666666668 | 0 |
| 0.9339351851851853 | 3 |
| 0.9341087962962963 | 3 |
| 0.9342361111111112 | 4 |
| 0.9345023148148148 | 1 |
| 0.9350347222222223 | 5 |
| 0.9360416666666667 | 6 |
| 0.9365046296296297 | 7 |
| 0.9378356481481481 | 0 |
| 0.9378703703703705 | 1 |
| 0.9382638888888889 | 2 |
| 0.938287037037037 | 6 |
| 0.9383217592592592 | 4 |
| 0.9384027777777778 | 6 |
| 0.9390046296296296 | 7 |
| 0.9394328703703704 | 2 |
| 0.9405208333333334 | 7 |
| 0.9409143518518519 | 3 |
| 0.9413425925925926 | 0 |
| 0.9416319444444444 | 3 |
| 0.9416435185185185 | 0 |
| 0.9421180555555555 | 5 |
| 0.9421527777777778 | 4 |
| 0.9423611111111111 | 5 |
| 0.942511574074074 | 1 |
| 0.9427430555555555 | 2 |
| 0.9429629629629629 | 1 |
| 0.9432175925925925 | 2 |
| 0.9434606481481481 | 3 |
| 0.9435648148148149 | 6 |
| 0.9438310185185186 | 4 |
| 0.9438541666666667 | 4 |
| 0.9448842592592593 | 5 |
| 0.9451967592592593 | 3 |
| 0.9455787037037037 | 7 |
| 0.9459490740740741 | 5 |
| 0.9464467592592593 | 6 |
| 0.9464583333333333 | 6 |
| 0.9469097222222222 | 7 |
| 0.9476620370370371 | 6 |
| 0.9482523148148148 | 0 |
| 0.948298611111111 | 1 |
| 0.9484027777777778 | 7 |
| 0.948912037037037 | 0 |
| 0.9489699074074074 | 0 |
| 0.9490046296296296 | 1 |
| 0.9494328703703704 | 2 |
| 0.9498611111111112 | 2 |
| 0.9500231481481481 | 3 |
| 0.9502893518518518 | 4 |
| 0.9503472222222222 | 7 |
| 0.9505324074074074 | 1 |
| 0.950625 | 5 |
| 0.9512268518518519 | 0 |
| 0.9513194444444445 | 6 |
| 0.9515162037037036 | 7 |
| 0.9517476851851852 | 0 |
| 0.9520717592592592 | 3 |
| 0.9522106481481482 | 1 |
| 0.9524074074074074 | 1 |
| 0.9524537037037036 | 4 |
| 0.9534143518518517 | 2 |
| 0.9542824074074074 | 4 |
| 0.9545370370370371 | 5 |
| 0.9549652777777777 | 3 |
| 0.9552314814814814 | 2 |
| 0.9553356481481482 | 5 |
| 0.9556365740740741 | 6 |
| 0.9557407407407408 | 7 |
| 0.9562152777777778 | 2 |
| 0.9566319444444445 | 0 |
| 0.9572916666666668 | 4 |
| 0.958136574074074 | 3 |
| 0.958136574074074 | 6 |
| 0.9589004629629629 | 3 |
| 0.9597337962962963 | 1 |
| 0.960150462962963 | 4 |
| 0.9603703703703704 | 5 |
| 0.9604513888888889 | 4 |
| 0.9606597222222222 | 2 |
| 0.9608333333333333 | 7 |
| 0.9611342592592593 | 5 |
| 0.9613773148148148 | 6 |
| 0.9615972222222222 | 6 |
| 0.9617129629629629 | 0 |
| 0.9617708333333334 | 3 |
| 0.961886574074074 | 5 |
| 0.9622685185185186 | 4 |
| 0.9627083333333334 | 1 |
| 0.9634375 | 7 |
| 0.9636342592592593 | 7 |
| 0.9649305555555556 | 6 |
| 0.9649421296296296 | 0 |
| 0.9657523148148148 | 2 |
| 0.965949074074074 | 7 |
| 0.9670717592592593 | 0 |
| 0.9671064814814815 | 1 |
| 0.9675462962962963 | 2 |
| 0.9675925925925926 | 1 |
| 0.968136574074074 | 3 |
| 0.9686689814814815 | 3 |
| 0.9692708333333333 | 0 |
| 0.970011574074074 | 2 |
| 0.9704861111111112 | 1 |
| 0.9706134259259259 | 4 |
| 0.9707870370370371 | 5 |
| 0.9710069444444445 | 4 |
| 0.9715046296296297 | 3 |
| 0.9716782407407408 | 5 |
| 0.9719328703703703 | 6 |
| 0.9727199074074074 | 5 |
| 0.9730324074074074 | 2 |
| 0.9738310185185185 | 6 |
| 0.9739467592592592 | 7 |
| 0.9740046296296296 | 7 |
| 0.9743402777777778 | 4 |
| 0.9745254629629629 | 5 |
| 0.9747800925925926 | 6 |
| 0.974849537037037 | 0 |
| 0.9749305555555555 | 6 |
| 0.9755208333333334 | 0 |
| 0.976400462962963 | 7 |
| 0.9772106481481481 | 0 |
| 0.9779861111111111 | 1 |
| 0.9781828703703703 | 1 |
| 0.9784143518518519 | 3 |
| 0.978923611111111 | 2 |
| 0.9799884259259258 | 7 |
| 0.9800578703703704 | 3 |
| 0.9805555555555556 | 4 |
| 0.9806134259259259 | 2 |
| 0.9812847222222222 | 0 |
| 0.9818287037037038 | 1 |
| 0.9821180555555555 | 3 |
| 0.9822916666666667 | 2 |
| 0.9828935185185186 | 4 |
| 0.9849652777777779 | 4 |
| 0.985162037037037 | 5 |
| 0.9855671296296297 | 6 |
| 0.9867592592592592 | 5 |
| 0.9870486111111111 | 7 |
| 0.9878587962962962 | 0 |
| 0.989201388888889 | 5 |
| 0.9896412037037038 | 3 |
| 0.9896875 | 4 |
| 0.9901736111111111 | 1 |
| 0.9902083333333334 | 5 |
| 0.9906481481481482 | 6 |
| 0.9911574074074073 | 2 |
| 0.9911805555555556 | 6 |
| 0.9916550925925925 | 7 |
| 0.9923148148148148 | 3 |
| 0.9930208333333334 | 0 |
| 0.9930671296296296 | 1 |
| 0.9932523148148148 | 6 |
| 0.9943518518518518 | 7 |
| 0.9946643518518519 | 2 |
| 0.9947800925925926 | 4 |
| 0.9955092592592593 | 0 |
| 0.9959490740740741 | 5 |
| 0.9961226851851852 | 1 |
| 0.9969212962962963 | 3 |
| 0.9974652777777777 | 2 |
| 0.9985416666666667 | 7 |
| 0.999050925925926 | 6 |
| 0.9998495370370369 | 0 |
| 0.0002546296296296296 | 5 |
| 0.0004050925925925926 | 1 |
| 0.0008680555555555555 | 2 |
| 0.0009027777777777778 | 1 |
| 0.0014699074074074074 | 7 |
| 0.0018750000000000001 | 2 |
| 0.0026620370370370374 | 5 |
| 0.003043981481481482 | 3 |
| 0.0031134259259259257 | 6 |
| 0.003356481481481481 | 0 |
| 0.003981481481481482 | 1 |
| 0.004236111111111111 | 2 |
| 0.004710648148148148 | 3 |
| 0.004884259259259259 | 6 |
| 0.005023148148148148 | 7 |
| 0.005520833333333333 | 4 |
| 0.0058564814814814825 | 7 |
| 0.006712962962962962 | 5 |
| 0.006759259259259259 | 0 |
| 0.007777777777777777 | 1 |
| 0.008252314814814815 | 0 |
| 0.00832175925925926 | 3 |
| 0.00837962962962963 | 4 |
| 0.008912037037037038 | 5 |
| 0.009351851851851853 | 6 |
| 0.00982638888888889 | 6 |
| 0.01019675925925926 | 4 |
| 0.01087962962962963 | 2 |
| 0.011006944444444444 | 1 |
| 0.011620370370370371 | 2 |
| 0.012187500000000002 | 3 |
| 0.012256944444444444 | 7 |
| 0.012881944444444446 | 5 |
| 0.013101851851851852 | 7 |
| 0.013136574074074077 | 6 |
| 0.013854166666666666 | 3 |
| 0.013969907407407408 | 7 |
| 0.014155092592592592 | 0 |
| 0.014270833333333335 | 0 |
| 0.014780092592592595 | 1 |
| 0.014895833333333332 | 1 |
| 0.015046296296296295 | 2 |
| 0.015405092592592593 | 0 |
| 0.015509259259259257 | 3 |
| 0.016238425925925924 | 4 |
| 0.016273148148148148 | 2 |
| 0.01693287037037037 | 5 |
| 0.017187499999999998 | 6 |
| 0.017997685185185186 | 3 |
| 0.018229166666666668 | 1 |
| 0.01888888888888889 | 4 |
| 0.019305555555555555 | 7 |
| 0.020462962962962964 | 4 |
| 0.020844907407407406 | 0 |
| 0.021030092592592597 | 4 |
| 0.02119212962962963 | 2 |
| 0.021238425925925924 | 5 |
| 0.02152777777777778 | 5 |
| 0.021550925925925928 | 6 |
| 0.023564814814814813 | 1 |
| 0.023738425925925923 | 5 |
| 0.023796296296296298 | 6 |
| 0.023923611111111114 | 7 |
| 0.023993055555555556 | 6 |
| 0.024826388888888887 | 3 |
| 0.024826388888888887 | 7 |
| 0.026053240740740738 | 2 |
| 0.026273148148148153 | 0 |
| 0.027164351851851853 | 7 |
| 0.027199074074074073 | 0 |
| 0.02758101851851852 | 3 |
| 0.02890046296296296 | 0 |
| 0.029108796296296296 | 1 |
| 0.029143518518518517 | 4 |
| 0.030000000000000002 | 1 |
| 0.030474537037037036 | 5 |
| 0.030497685185185183 | 4 |
| 0.030625 | 2 |
| 0.030694444444444444 | 5 |
| 0.031006944444444445 | 1 |
| 0.031099537037037037 | 6 |
| 0.031203703703703702 | 3 |
| 0.03200231481481482 | 6 |
| 0.03209490740740741 | 2 |
| 0.03231481481481482 | 2 |
| 0.032615740740740744 | 7 |
| 0.03274305555555555 | 3 |
| 0.03288194444444444 | 5 |
| 0.0334375 | 0 |
| 0.033796296296296297 | 0 |
| 0.034374999999999996 | 1 |
| 0.035740740740740747 | 3 |
| 0.035937500000000004 | 2 |
| 0.03629629629629629 | 6 |
| 0.037083333333333336 | 7 |
| 0.03710648148148148 | 0 |
| 0.037488425925925925 | 1 |
| 0.03799768518518518 | 4 |
| 0.04009259259259259 | 4 |
| 0.040324074074074075 | 3 |
| 0.04037037037037037 | 5 |
| 0.04069444444444444 | 6 |
| 0.04142361111111111 | 5 |
| 0.04278935185185185 | 2 |
| 0.04296296296296296 | 6 |
| 0.04344907407407408 | 4 |
| 0.04372685185185185 | 7 |
| 0.044270833333333336 | 3 |
| 0.04476851851851852 | 0 |
| 0.0453587962962963 | 1 |
| 0.04600694444444445 | 5 |
| 0.04638888888888889 | 7 |
| 0.046747685185185184 | 1 |
| 0.04693287037037037 | 2 |
| 0.04737268518518519 | 6 |
| 0.047754629629629626 | 2 |
| 0.04814814814814814 | 0 |
| 0.048935185185185186 | 3 |
| 0.05028935185185185 | 1 |
| 0.05032407407407408 | 7 |
| 0.051342592592592586 | 3 |
| 0.0514699074074074 | 4 |
| 0.05162037037037037 | 2 |
| 0.05204861111111111 | 3 |
| 0.05206018518518518 | 4 |
| 0.0521875 | 5 |
| 0.052569444444444446 | 0 |
| 0.05268518518518519 | 5 |
| 0.05447916666666667 | 4 |
| 0.05565972222222223 | 6 |
| 0.05585648148148148 | 6 |
| 0.05644675925925926 | 7 |
| 0.056469907407407406 | 0 |
| 0.05686342592592592 | 1 |
| 0.05689814814814815 | 4 |
| 0.05704861111111111 | 5 |
| 0.057789351851851856 | 5 |
| 0.05797453703703703 | 1 |
| 0.05833333333333333 | 7 |
| 0.058437499999999996 | 6 |
| 0.060277777777777784 | 0 |
| 0.06092592592592593 | 1 |
| 0.06118055555555555 | 2 |
| 0.06140046296296297 | 7 |
| 0.06166666666666667 | 3 |
| 0.06224537037037037 | 2 |
| 0.06266203703703704 | 3 |
| 0.0636574074074074 | 0 |
| 0.06373842592592592 | 3 |
| 0.0650462962962963 | 4 |
| 0.06539351851851852 | 5 |
| 0.06730324074074073 | 4 |
| 0.06752314814814815 | 6 |
| 0.06826388888888889 | 7 |
| 0.06909722222222221 | 1 |
| 0.0696875 | 2 |
| 0.07005787037037037 | 5 |
| 0.07032407407407408 | 6 |
| 0.07116898148148149 | 7 |
| 0.07265046296296296 | 0 |
| 0.07380787037037037 | 3 |
| 0.07381944444444444 | 6 |
| 0.07524305555555556 | 7 |
| 0.07530092592592592 | 1 |
| 0.07532407407407408 | 2 |
| 0.07554398148148149 | 1 |
| 0.07554398148148149 | 3 |
| 0.07611111111111112 | 0 |
| 0.0762037037037037 | 4 |
| 0.07640046296296296 | 4 |
| 0.07655092592592593 | 4 |
| 0.07655092592592593 | 5 |
| 0.07726851851851851 | 1 |
| 0.0774537037037037 | 5 |
| 0.07752314814814815 | 5 |
| 0.07857638888888889 | 6 |
| 0.07858796296296296 | 2 |
| 0.07961805555555555 | 2 |
| 0.0797800925925926 | 7 |
| 0.08077546296296297 | 0 |
| 0.08182870370370371 | 3 |
| 0.08231481481481481 | 3 |
| 0.08502314814814815 | 6 |
| 0.08630787037037037 | 1 |
| 0.08645833333333335 | 7 |
| 0.08674768518518518 | 4 |
| 0.08732638888888888 | 6 |
| 0.08732638888888888 | 0 |
| 0.0880787037037037 | 7 |
| 0.08811342592592593 | 5 |
| 0.08849537037037036 | 2 |
| 0.08849537037037036 | 1 |
| 0.08953703703703704 | 0 |
| 0.08968749999999999 | 6 |
| 0.08980324074074074 | 4 |
| 0.09033564814814815 | 5 |
| 0.09046296296296297 | 7 |
| 0.09086805555555555 | 2 |
| 0.09128472222222223 | 6 |
| 0.09151620370370371 | 0 |
| 0.09211805555555556 | 3 |
| 0.09212962962962963 | 1 |
| 0.0930787037037037 | 3 |
| 0.09372685185185185 | 2 |
| 0.0950925925925926 | 7 |
| 0.09519675925925926 | 4 |
| 0.09521990740740742 | 1 |
| 0.09524305555555555 | 2 |
| 0.09546296296296297 | 3 |
| 0.09631944444444444 | 4 |
| 0.09746527777777779 | 5 |
| 0.09822916666666666 | 3 |
| 0.0985300925925926 | 6 |
| 0.0997337962962963 | 0 |
| 0.09974537037037036 | 7 |
| 0.10076388888888889 | 0 |
| 0.10111111111111111 | 4 |
| 0.10143518518518518 | 4 |
| 0.10164351851851851 | 5 |
| 0.1024074074074074 | 1 |
| 0.10260416666666666 | 6 |
| 0.10265046296296297 | 5 |
| 0.10289351851851852 | 2 |
| 0.10334490740740741 | 3 |
| 0.1040625 | 5 |
| 0.10410879629629628 | 6 |
| 0.10546296296296297 | 6 |
| 0.10567129629629629 | 7 |
| 0.10570601851851852 | 0 |
| 0.10637731481481481 | 1 |
| 0.10643518518518519 | 7 |
| 0.10704861111111112 | 1 |
| 0.10815972222222221 | 2 |
| 0.10849537037037038 | 7 |
| 0.10859953703703702 | 2 |
| 0.10921296296296296 | 4 |
| 0.11079861111111111 | 0 |
| 0.11094907407407407 | 5 |
| 0.11108796296296297 | 0 |
| 0.11226851851851853 | 3 |
| 0.11246527777777778 | 6 |
| 0.11378472222222223 | 1 |
| 0.11390046296296297 | 3 |
| 0.11428240740740742 | 2 |
| 0.11472222222222223 | 3 |
| 0.11539351851851852 | 4 |
| 0.11635416666666666 | 1 |
| 0.11695601851851851 | 2 |
| 0.11716435185185185 | 7 |
| 0.11974537037037036 | 4 |
| 0.12026620370370371 | 5 |
| 0.12063657407407408 | 4 |
| 0.12075231481481481 | 0 |
| 0.1211574074074074 | 3 |
| 0.12237268518518518 | 5 |
| 0.12295138888888889 | 5 |
| 0.12361111111111112 | 4 |
| 0.12390046296296296 | 6 |
| 0.12396990740740742 | 5 |
| 0.12443287037037037 | 6 |
| 0.12497685185185185 | 6 |
| 0.12508101851851852 | 7 |
| 0.12539351851851852 | 1 |
| 0.12568287037037038 | 0 |
| 0.12600694444444444 | 7 |
| 0.12604166666666666 | 0 |
| 0.12609953703703705 | 2 |
| 0.1274074074074074 | 1 |
| 0.1285300925925926 | 2 |
| 0.1286226851851852 | 7 |
| 0.12865740740740741 | 1 |
| 0.12954861111111113 | 2 |
| 0.13023148148148148 | 3 |
| 0.13047453703703704 | 3 |
| 0.13076388888888887 | 4 |
| 0.13162037037037036 | 4 |
| 0.1322337962962963 | 0 |
| 0.13244212962962962 | 6 |
| 0.13261574074074076 | 6 |
| 0.13407407407407407 | 7 |
| 0.13436342592592593 | 3 |
| 0.13467592592592592 | 5 |
| 0.1348263888888889 | 7 |
| 0.13495370370370371 | 0 |
| 0.13615740740740742 | 1 |
| 0.13636574074074073 | 0 |
| 0.13689814814814816 | 1 |
| 0.13716435185185186 | 1 |
| 0.13761574074074076 | 2 |
| 0.1376388888888889 | 2 |
| 0.13856481481481484 | 2 |
| 0.14028935185185185 | 4 |
| 0.14059027777777777 | 6 |
| 0.14081018518518518 | 5 |
| 0.14083333333333334 | 3 |
| 0.1417824074074074 | 3 |
| 0.14188657407407407 | 3 |
| 0.1420486111111111 | 4 |
| 0.14216435185185186 | 5 |
| 0.1423148148148148 | 4 |
| 0.14332175925925925 | 6 |
| 0.1454050925925926 | 7 |
| 0.14559027777777778 | 6 |
| 0.14570601851851853 | 7 |
| 0.14577546296296295 | 7 |
| 0.14625 | 5 |
| 0.14630787037037038 | 0 |
| 0.14640046296296297 | 0 |
| 0.1478587962962963 | 1 |
| 0.1483449074074074 | 2 |
| 0.1486574074074074 | 3 |
| 0.14869212962962963 | 4 |
| 0.1490162037037037 | 4 |
| 0.14918981481481483 | 5 |
| 0.14932870370370369 | 1 |
| 0.14957175925925925 | 5 |
| 0.1502314814814815 | 2 |
| 0.1505439814814815 | 6 |
| 0.15118055555555557 | 3 |
| 0.15149305555555556 | 0 |
| 0.1516550925925926 | 6 |
| 0.15219907407407407 | 1 |
| 0.15219907407407407 | 6 |
| 0.15233796296296295 | 4 |
| 0.15263888888888888 | 2 |
| 0.1529513888888889 | 5 |
| 0.1531597222222222 | 6 |
| 0.1544560185185185 | 7 |
| 0.15462962962962964 | 3 |
| 0.15559027777777779 | 7 |
| 0.15715277777777778 | 0 |
| 0.1574074074074074 | 7 |
| 0.15752314814814813 | 4 |
| 0.1579513888888889 | 1 |
| 0.15799768518518517 | 5 |
| 0.1580439814814815 | 6 |
| 0.1584375 | 2 |
| 0.15921296296296297 | 0 |
| 0.15947916666666667 | 7 |
| 0.1619560185185185 | 1 |
| 0.1619560185185185 | 7 |
| 0.16246527777777778 | 2 |
| 0.1624884259259259 | 0 |
| 0.16274305555555554 | 3 |
| 0.1629050925925926 | 4 |
| 0.16291666666666668 | 3 |
| 0.1630324074074074 | 5 |
| 0.16317129629629631 | 0 |
| 0.1633564814814815 | 0 |
| 0.16387731481481482 | 1 |
| 0.16417824074074075 | 1 |
| 0.16420138888888888 | 6 |
| 0.16431712962962963 | 2 |
| 0.1647800925925926 | 1 |
| 0.16630787037037037 | 7 |
| 0.16633101851851853 | 3 |
| 0.16725694444444447 | 2 |
| 0.1673148148148148 | 0 |
| 0.16880787037037037 | 1 |
| 0.16894675925925925 | 4 |
| 0.16922453703703702 | 4 |
| 0.16929398148148148 | 2 |
| 0.16961805555555556 | 3 |
| 0.16965277777777776 | 4 |
| 0.16969907407407406 | 5 |
| 0.16975694444444445 | 6 |
| 0.17016203703703703 | 5 |
| 0.17055555555555557 | 3 |
| 0.17072916666666668 | 5 |
| 0.17228009259259258 | 6 |
| 0.17265046296296296 | 6 |
| 0.1730787037037037 | 4 |
| 0.17369212962962963 | 7 |
| 0.1750810185185185 | 2 |
| 0.17509259259259258 | 0 |
| 0.17585648148148147 | 5 |
| 0.1764351851851852 | 6 |
| 0.17652777777777776 | 1 |
| 0.17672453703703703 | 3 |
| 0.1769212962962963 | 7 |
| 0.17706018518518518 | 0 |
| 0.17710648148148148 | 7 |
| 0.18059027777777778 | 7 |
| 0.180625 | 4 |
| 0.18078703703703702 | 0 |
| 0.18288194444444447 | 1 |
| 0.1832638888888889 | 5 |
| 0.1836458333333333 | 0 |
| 0.18385416666666665 | 2 |
| 0.18449074074074076 | 3 |
| 0.18494212962962964 | 4 |
| 0.1851851851851852 | 6 |
| 0.18535879629629629 | 1 |
| 0.18555555555555556 | 1 |
| 0.18561342592592592 | 7 |
| 0.18628472222222223 | 2 |
| 0.18636574074074075 | 0 |
| 0.18689814814814817 | 2 |
| 0.18704861111111112 | 1 |
| 0.18839120370370369 | 5 |
| 0.1884837962962963 | 2 |
| 0.18855324074074073 | 3 |
| 0.18903935185185183 | 2 |
| 0.1894212962962963 | 3 |
| 0.18964120370370371 | 4 |
| 0.1905324074074074 | 3 |
| 0.19065972222222224 | 5 |
| 0.1910763888888889 | 4 |
| 0.19118055555555555 | 6 |
| 0.19181712962962963 | 3 |
| 0.19190972222222222 | 7 |
| 0.19247685185185184 | 4 |
| 0.1925462962962963 | 6 |
| 0.194375 | 4 |
| 0.1950925925925926 | 5 |
| 0.19512731481481482 | 5 |
| 0.19538194444444446 | 0 |
| 0.1970601851851852 | 6 |
| 0.19721064814814815 | 5 |
| 0.1975 | 7 |
| 0.19755787037037034 | 1 |
| 0.19778935185185187 | 6 |
| 0.19824074074074075 | 0 |
| 0.198287037037037 | 7 |
| 0.19842592592592592 | 0 |
| 0.1989351851851852 | 1 |
| 0.19989583333333336 | 7 |
| 0.20033564814814817 | 2 |
| 0.2009375 | 2 |
| 0.20116898148148146 | 6 |
| 0.2013310185185185 | 3 |
| 0.20155092592592594 | 4 |
| 0.20256944444444444 | 5 |
| 0.20300925925925925 | 0 |
| 0.2034027777777778 | 3 |
| 0.2043287037037037 | 1 |
| 0.2043287037037037 | 4 |
| 0.2044675925925926 | 6 |
| 0.20456018518518518 | 1 |
| 0.20526620370370371 | 2 |
| 0.2053125 | 2 |
| 0.20596064814814816 | 3 |
| 0.2064236111111111 | 4 |
| 0.2064814814814815 | 7 |
| 0.2070949074074074 | 3 |
| 0.20991898148148147 | 5 |
| 0.21 | 4 |
| 0.21077546296296298 | 5 |
| 0.2118634259259259 | 7 |
| 0.2123611111111111 | 0 |
| 0.21275462962962963 | 6 |
| 0.21307870370370371 | 1 |
| 0.21328703703703702 | 5 |
| 0.21349537037037036 | 7 |
| 0.2135300925925926 | 2 |
| 0.2136111111111111 | 6 |
| 0.2141087962962963 | 6 |
| 0.2145138888888889 | 7 |
| 0.215 | 0 |
| 0.2155787037037037 | 3 |
| 0.2165625 | 1 |
| 0.2170023148148148 | 0 |
| 0.21725694444444443 | 2 |
| 0.21755787037037036 | 7 |
| 0.21854166666666666 | 4 |
| 0.2190277777777778 | 5 |
| 0.2190740740740741 | 6 |
| 0.21910879629629632 | 3 |
| 0.21921296296296297 | 1 |
| 0.21928240740740743 | 0 |
| 0.21928240740740743 | 0 |
| 0.21989583333333332 | 1 |
| 0.21997685185185187 | 1 |
| 0.22092592592592594 | 2 |
| 0.22202546296296297 | 4 |
| 0.22203703703703703 | 2 |
| 0.2228125 | 5 |
| 0.22310185185185186 | 7 |
| 0.22453703703703706 | 0 |
| 0.2251388888888889 | 3 |
| 0.22565972222222222 | 6 |
| 0.22576388888888888 | 2 |
| 0.22599537037037035 | 1 |
| 0.22608796296296296 | 4 |
| 0.22619212962962965 | 3 |
| 0.2265625 | 4 |
| 0.22657407407407407 | 7 |
| 0.2267361111111111 | 5 |
| 0.2290509259259259 | 3 |
| 0.22916666666666666 | 6 |
| 0.22999999999999998 | 4 |
| 0.23011574074074073 | 5 |
| 0.23093750000000002 | 6 |
| 0.23136574074074076 | 0 |
| 0.23149305555555555 | 7 |
| 0.23164351851851853 | 7 |
| 0.2320601851851852 | 1 |
| 0.2346527777777778 | 0 |
| 0.23517361111111112 | 5 |
| 0.23599537037037036 | 6 |
| 0.23657407407407408 | 2 |
| 0.23788194444444444 | 2 |
| 0.2380324074074074 | 0 |
| 0.23826388888888891 | 3 |
| 0.23827546296296295 | 1 |
| 0.23896990740740742 | 2 |
| 0.23931712962962962 | 3 |
| 0.23949074074074073 | 7 |
| 0.24045138888888887 | 4 |
| 0.24118055555555554 | 3 |
| 0.24125 | 0 |
| 0.24145833333333333 | 1 |
| 0.24149305555555556 | 5 |
| 0.24187499999999998 | 1 |
| 0.2421412037037037 | 4 |
| 0.24225694444444446 | 5 |
| 0.24226851851851852 | 4 |
| 0.24291666666666667 | 2 |
| 0.24307870370370369 | 6 |
| 0.24359953703703704 | 2 |
| 0.2437962962962963 | 7 |
| 0.24424768518518516 | 6 |
| 0.24497685185185183 | 5 |
| 0.2460416666666667 | 3 |
| 0.24694444444444444 | 6 |
| 0.24739583333333334 | 7 |
| 0.2476851851851852 | 7 |
| 0.24815972222222224 | 0 |
| 0.2482523148148148 | 3 |
| 0.2483912037037037 | 4 |
| 0.24862268518518518 | 4 |
| 0.24881944444444445 | 5 |
| 0.24885416666666668 | 5 |
| 0.24886574074074075 | 1 |
| 0.24943287037037035 | 6 |
| 0.2502199074074074 | 0 |
| 0.25046296296296294 | 1 |
| 0.25090277777777775 | 2 |
| 0.2511574074074074 | 2 |
| 0.25127314814814816 | 6 |
| 0.2512962962962963 | 3 |
| 0.2515162037037037 | 3 |
| 0.2515277777777778 | 4 |
| 0.251875 | 0 |
| 0.2520949074074074 | 7 |
| 0.2521875 | 0 |
| 0.25256944444444446 | 5 |
| 0.25265046296296295 | 4 |
| 0.25309027777777776 | 1 |
| 0.25363425925925925 | 7 |
| 0.2537037037037037 | 5 |
| 0.2544560185185185 | 2 |
| 0.25450231481481483 | 6 |
| 0.25516203703703705 | 3 |
| 0.25524305555555554 | 1 |
| 0.25646990740740744 | 6 |
| 0.2565972222222222 | 4 |
| 0.2568402777777778 | 0 |
| 0.25755787037037037 | 2 |
| 0.25993055555555555 | 5 |
| 0.25993055555555555 | 7 |
| 0.2604166666666667 | 6 |
| 0.2609490740740741 | 3 |
| 0.2620486111111111 | 7 |
| 0.2631597222222222 | 7 |
| 0.2636574074074074 | 4 |
| 0.26373842592592595 | 1 |
| 0.2639930555555556 | 5 |
| 0.26415509259259257 | 0 |
| 0.26525462962962965 | 0 |
| 0.2653587962962963 | 1 |
| 0.2658333333333333 | 0 |
| 0.26592592592592595 | 2 |
| 0.2667361111111111 | 2 |
| 0.2668055555555556 | 1 |
| 0.26685185185185184 | 1 |
| 0.267025462962963 | 2 |
| 0.2673263888888889 | 6 |
| 0.2674537037037037 | 3 |
| 0.2675578703703704 | 2 |
| 0.2679976851851852 | 3 |
| 0.26818287037037036 | 7 |
| 0.2683912037037037 | 3 |
| 0.26890046296296294 | 4 |
| 0.2693055555555555 | 0 |
| 0.26944444444444443 | 3 |
| 0.2697337962962963 | 1 |
| 0.269849537037037 | 2 |
| 0.2699884259259259 | 3 |
| 0.2706134259259259 | 4 |
| 0.27077546296296295 | 4 |
| 0.2712384259259259 | 5 |
| 0.27153935185185185 | 5 |
| 0.2718287037037037 | 6 |
| 0.2722453703703704 | 5 |
| 0.27241898148148147 | 4 |
| 0.27274305555555556 | 6 |
| 0.2732175925925926 | 5 |
| 0.2733449074074074 | 6 |
| 0.274537037037037 | 7 |
| 0.2746180555555556 | 0 |
| 0.2754976851851852 | 7 |
| 0.2761226851851852 | 6 |
| 0.2770601851851852 | 7 |
| 0.27771990740740743 | 1 |
| 0.2780787037037037 | 7 |
| 0.27813657407407405 | 0 |
| 0.27818287037037037 | 0 |
| 0.2782175925925926 | 4 |
| 0.2785416666666667 | 1 |
| 0.2791666666666667 | 1 |
| 0.2793865740740741 | 2 |
| 0.27975694444444443 | 2 |
| 0.2800694444444444 | 5 |
| 0.2800810185185185 | 2 |
| 0.2803587962962963 | 3 |
| 0.28074074074074074 | 3 |
| 0.28195601851851854 | 0 |
| 0.28197916666666667 | 6 |
| 0.282662037037037 | 1 |
| 0.28303240740740737 | 7 |
| 0.2835185185185185 | 3 |
| 0.2839467592592593 | 4 |
| 0.28445601851851854 | 5 |
| 0.28466435185185185 | 0 |
| 0.2862615740740741 | 4 |
| 0.28649305555555554 | 1 |
| 0.2865972222222222 | 5 |
| 0.28859953703703706 | 6 |
| 0.2886111111111111 | 2 |
| 0.28998842592592594 | 6 |
| 0.29064814814814816 | 4 |
| 0.29084490740740737 | 7 |
| 0.2910300925925926 | 7 |
| 0.2912615740740741 | 2 |
| 0.29153935185185187 | 0 |
| 0.2919791666666667 | 3 |
| 0.2919907407407408 | 0 |
| 0.2924189814814815 | 1 |
| 0.2925 | 5 |
| 0.2925462962962963 | 2 |
| 0.2926736111111111 | 3 |
| 0.2929513888888889 | 4 |
| 0.2930671296296296 | 5 |
| 0.2931712962962963 | 3 |
| 0.2933101851851852 | 4 |
| 0.29391203703703705 | 6 |
| 0.29409722222222223 | 1 |
| 0.2942476851851852 | 5 |
| 0.29443287037037036 | 6 |
| 0.29464120370370367 | 7 |
| 0.29506944444444444 | 4 |
| 0.2954861111111111 | 7 |
| 0.2954976851851852 | 5 |
| 0.2958449074074074 | 2 |
| 0.29585648148148147 | 6 |
| 0.2960763888888889 | 6 |
| 0.29637731481481483 | 7 |
| 0.29712962962962963 | 0 |
| 0.2989699074074074 | 1 |
| 0.3008912037037037 | 7 |
| 0.30094907407407406 | 0 |
| 0.30094907407407406 | 0 |
| 0.3012037037037037 | 0 |
| 0.30136574074074074 | 1 |
| 0.3014467592592593 | 1 |
| 0.3014699074074074 | 1 |
| 0.30216435185185186 | 2 |
| 0.3025231481481481 | 3 |
| 0.3025925925925926 | 2 |
| 0.30300925925925926 | 3 |
| 0.303587962962963 | 3 |
| 0.30368055555555556 | 4 |
| 0.30377314814814815 | 2 |
| 0.3045023148148148 | 4 |
| 0.30454861111111114 | 5 |
| 0.30475694444444446 | 5 |
| 0.30504629629629626 | 6 |
| 0.3053472222222222 | 2 |
| 0.30569444444444444 | 3 |
| 0.3068287037037037 | 4 |
| 0.30734953703703705 | 5 |
| 0.3074537037037037 | 3 |
| 0.30746527777777777 | 7 |
| 0.30758101851851855 | 6 |
| 0.3075925925925926 | 4 |
| 0.3080324074074074 | 5 |
| 0.3083796296296296 | 6 |
| 0.30856481481481485 | 4 |
| 0.308912037037037 | 7 |
| 0.3095023148148148 | 0 |
| 0.3110648148148148 | 1 |
| 0.3111111111111111 | 7 |
| 0.3115625 | 6 |
| 0.31280092592592595 | 2 |
| 0.31300925925925926 | 3 |
| 0.31351851851851853 | 0 |
| 0.3140277777777778 | 7 |
| 0.31403935185185183 | 1 |
| 0.3145486111111111 | 0 |
| 0.3145949074074074 | 5 |
| 0.3154166666666667 | 0 |
| 0.3166550925925926 | 1 |
| 0.3171296296296296 | 1 |
| 0.3174884259259259 | 4 |
| 0.3178240740740741 | 6 |
| 0.31785879629629626 | 7 |
| 0.3179398148148148 | 2 |
| 0.31806712962962963 | 2 |
| 0.3187962962962963 | 3 |
| 0.318900462962963 | 2 |
| 0.3191087962962963 | 5 |
| 0.32005787037037037 | 3 |
| 0.32023148148148145 | 0 |
| 0.3202662037037037 | 4 |
| 0.3211689814814815 | 4 |
| 0.3213078703703704 | 1 |
| 0.3231365740740741 | 2 |
| 0.3236805555555556 | 5 |
| 0.32418981481481485 | 6 |
| 0.32555555555555554 | 3 |
| 0.32586805555555554 | 4 |
| 0.3259837962962963 | 6 |
| 0.3261689814814815 | 3 |
| 0.32634259259259263 | 5 |
| 0.32700231481481484 | 7 |
| 0.3272453703703704 | 5 |
| 0.3276967592592593 | 4 |
| 0.3277314814814815 | 5 |
| 0.3282407407407408 | 6 |
| 0.3282523148148148 | 7 |
| 0.3284375 | 6 |
| 0.32858796296296294 | 0 |
| 0.3289930555555555 | 1 |
| 0.3297453703703704 | 0 |
| 0.3304976851851852 | 6 |
| 0.3305208333333333 | 7 |
| 0.33069444444444446 | 7 |
| 0.3307407407407407 | 1 |
| 0.33096064814814813 | 2 |
| 0.3319675925925926 | 3 |
| 0.33230324074074075 | 7 |
| 0.3327662037037037 | 0 |
| 0.3329166666666667 | 0 |
| 0.3339236111111111 | 2 |
| 0.3340046296296297 | 1 |
| 0.33425925925925926 | 0 |
| 0.33434027777777775 | 1 |
| 0.3358449074074074 | 2 |
| 0.3361111111111111 | 2 |
| 0.33631944444444445 | 3 |
| 0.3372453703703704 | 3 |
| 0.3373263888888889 | 4 |
| 0.33827546296296296 | 3 |
| 0.33858796296296295 | 4 |
| 0.3390625 | 5 |
| 0.34085648148148145 | 4 |
| 0.34087962962962964 | 5 |
| 0.3411689814814815 | 6 |
| 0.34246527777777774 | 4 |
| 0.34251157407407407 | 5 |
| 0.34407407407407403 | 6 |
| 0.3443634259259259 | 5 |
| 0.3444212962962963 | 1 |
| 0.34447916666666667 | 7 |
| 0.3450578703703704 | 7 |
| 0.345625 | 0 |
| 0.34631944444444446 | 6 |
| 0.34700231481481486 | 2 |
| 0.3470138888888889 | 1 |
| 0.347025462962963 | 0 |
| 0.3471990740740741 | 3 |
| 0.34739583333333335 | 7 |
| 0.3474074074074074 | 4 |
| 0.348900462962963 | 2 |
| 0.34908564814814813 | 0 |
| 0.3494791666666666 | 6 |
| 0.3503125 | 5 |
| 0.35085648148148146 | 3 |
| 0.3509490740740741 | 1 |
| 0.35137731481481477 | 4 |
| 0.3516550925925926 | 5 |
| 0.3517824074074074 | 7 |
| 0.3521180555555556 | 0 |
| 0.3525347222222222 | 1 |
| 0.3532175925925926 | 6 |
| 0.35442129629629626 | 6 |
| 0.3554050925925926 | 7 |
| 0.35563657407407406 | 0 |
| 0.35585648148148147 | 2 |
| 0.3561111111111111 | 1 |
| 0.3572685185185185 | 1 |
| 0.3575347222222222 | 2 |
| 0.35782407407407407 | 3 |
| 0.35883101851851856 | 7 |
| 0.35935185185185187 | 0 |
| 0.35965277777777777 | 2 |
| 0.3597685185185185 | 4 |
| 0.35986111111111113 | 2 |
| 0.3599305555555556 | 3 |
| 0.36005787037037035 | 3 |
| 0.3602083333333333 | 5 |
| 0.3602662037037037 | 4 |
| 0.3605671296296296 | 6 |
| 0.3609027777777778 | 3 |
| 0.3609837962962963 | 4 |
| 0.36109953703703707 | 7 |
| 0.36319444444444443 | 5 |
| 0.3638194444444445 | 1 |
| 0.36393518518518514 | 2 |
| 0.3645833333333333 | 5 |
| 0.3646643518518518 | 3 |
| 0.36515046296296294 | 4 |
| 0.36581018518518515 | 0 |
| 0.3661111111111111 | 6 |
| 0.3663310185185185 | 1 |
| 0.3666666666666667 | 4 |
| 0.3678240740740741 | 6 |
| 0.3682407407407407 | 7 |
| 0.36831018518518516 | 7 |
| 0.3685416666666667 | 0 |
| 0.36885416666666665 | 5 |
| 0.3690277777777778 | 1 |
| 0.3694097222222222 | 0 |
| 0.3696875 | 5 |
| 0.36982638888888886 | 6 |
| 0.37016203703703704 | 6 |
| 0.3703240740740741 | 2 |
| 0.3707291666666667 | 7 |
| 0.3708101851851852 | 1 |
| 0.3724768518518518 | 3 |
| 0.37258101851851855 | 2 |
| 0.3727199074074074 | 2 |
| 0.3728587962962963 | 3 |
| 0.37305555555555553 | 7 |
| 0.37362268518518515 | 4 |
| 0.3738310185185185 | 0 |
| 0.3746990740740741 | 3 |
| 0.37524305555555554 | 4 |
| 0.3755208333333333 | 5 |
| 0.37672453703703707 | 0 |
| 0.377662037037037 | 1 |
| 0.37778935185185186 | 1 |
| 0.378125 | 4 |
| 0.3783217592592592 | 6 |
| 0.37920138888888894 | 2 |
| 0.3792361111111111 | 2 |
| 0.3798148148148148 | 5 |
| 0.3809722222222222 | 3 |
| 0.3809837962962963 | 3 |
| 0.3818402777777778 | 5 |
| 0.38240740740740736 | 4 |
| 0.3824537037037037 | 5 |
| 0.3826388888888889 | 6 |
| 0.38280092592592596 | 7 |
| 0.38282407407407404 | 6 |
| 0.3829050925925926 | 4 |
| 0.3829861111111111 | 5 |
| 0.383125 | 6 |
| 0.3831597222222222 | 7 |
| 0.38327546296296294 | 7 |
| 0.3833333333333333 | 0 |
| 0.38488425925925923 | 6 |
| 0.3850810185185185 | 0 |
| 0.38540509259259265 | 7 |
| 0.38560185185185186 | 0 |
| 0.3859143518518518 | 0 |
| 0.3860763888888889 | 7 |
| 0.38663194444444443 | 1 |
| 0.3867129629629629 | 1 |
| 0.3868634259259259 | 0 |
| 0.38765046296296296 | 1 |
| 0.38785879629629627 | 1 |
| 0.38797453703703705 | 2 |
| 0.3884375 | 2 |
| 0.38858796296296294 | 2 |
| 0.3886226851851852 | 3 |
| 0.3886921296296297 | 2 |
| 0.3887152777777778 | 3 |
| 0.3907407407407408 | 4 |
| 0.39083333333333337 | 1 |
| 0.3910648148148148 | 3 |
| 0.3913773148148148 | 4 |
| 0.39138888888888884 | 4 |
| 0.391875 | 5 |
| 0.39229166666666665 | 2 |
| 0.39285879629629633 | 3 |
| 0.3938078703703704 | 5 |
| 0.39401620370370366 | 6 |
| 0.39403935185185185 | 3 |
| 0.3942824074074074 | 6 |
| 0.3948611111111111 | 6 |
| 0.3948611111111111 | 7 |
| 0.39598379629629626 | 4 |
| 0.39606481481481487 | 5 |
| 0.3967824074074074 | 4 |
| 0.39721064814814816 | 7 |
| 0.397349537037037 | 5 |
| 0.39797453703703706 | 6 |
| 0.3979861111111111 | 7 |
| 0.39850694444444446 | 7 |
| 0.3990162037037037 | 0 |
| 0.39999999999999997 | 0 |
| 0.4006134259259259 | 6 |
| 0.4007638888888889 | 1 |
| 0.40094907407407404 | 0 |
| 0.4011805555555556 | 0 |
| 0.4014351851851852 | 7 |
| 0.4015625 | 2 |
| 0.40174768518518517 | 3 |
| 0.4018981481481481 | 1 |
| 0.402650462962963 | 1 |
| 0.4032523148148148 | 0 |
| 0.40343749999999995 | 1 |
| 0.40346064814814814 | 2 |
| 0.4045138888888889 | 4 |
| 0.40526620370370375 | 3 |
| 0.4056018518518518 | 2 |
| 0.4059837962962963 | 5 |
| 0.40671296296296294 | 4 |
| 0.40674768518518517 | 5 |
| 0.40695601851851854 | 6 |
| 0.40759259259259256 | 7 |
| 0.4076388888888889 | 3 |
| 0.40802083333333333 | 6 |
| 0.40942129629629626 | 0 |
| 0.409849537037037 | 4 |
| 0.4103819444444445 | 7 |
| 0.4104398148148148 | 1 |
| 0.4106828703703704 | 2 |
| 0.41099537037037037 | 1 |
| 0.4124305555555556 | 5 |
| 0.4130671296296296 | 6 |
| 0.4130902777777778 | 2 |
| 0.4130902777777778 | 2 |
| 0.413287037037037 | 3 |
| 0.4134953703703704 | 4 |
| 0.41438657407407403 | 0 |
| 0.41510416666666666 | 3 |
| 0.41574074074074074 | 4 |
| 0.4158564814814815 | 1 |
| 0.4163310185185185 | 7 |
| 0.41649305555555555 | 5 |
| 0.41709490740740746 | 0 |
| 0.41712962962962963 | 5 |
| 0.41731481481481486 | 3 |
| 0.41753472222222227 | 6 |
| 0.4181134259259259 | 1 |
| 0.4188310185185185 | 2 |
| 0.4189467592592593 | 2 |
| 0.4194675925925926 | 6 |
| 0.41953703703703704 | 7 |
| 0.41997685185185185 | 3 |
| 0.4208796296296296 | 3 |
| 0.4212962962962963 | 4 |
| 0.42171296296296296 | 7 |
| 0.42172453703703705 | 4 |
| 0.42186342592592596 | 5 |
| 0.4219560185185185 | 0 |
| 0.4224421296296296 | 1 |
| 0.4228356481481481 | 0 |
| 0.42310185185185184 | 4 |
| 0.42390046296296297 | 1 |
| 0.4247916666666667 | 2 |
| 0.4251736111111111 | 6 |
| 0.425474537037037 | 5 |
| 0.42570601851851847 | 5 |
| 0.4260069444444445 | 7 |
| 0.4260185185185185 | 3 |
| 0.42607638888888894 | 2 |
| 0.4263425925925926 | 6 |
| 0.42635416666666665 | 3 |
| 0.4273263888888889 | 6 |
| 0.4278587962962963 | 0 |
| 0.42804398148148143 | 1 |
| 0.4281712962962963 | 4 |
| 0.42818287037037034 | 7 |
| 0.42854166666666665 | 0 |
| 0.42961805555555554 | 7 |
| 0.43039351851851854 | 0 |
| 0.43141203703703707 | 1 |
| 0.43172453703703706 | 4 |
| 0.43225694444444446 | 2 |
| 0.43247685185185186 | 1 |
| 0.43276620370370367 | 5 |
| 0.43321759259259257 | 2 |
| 0.43329861111111106 | 3 |
| 0.43350694444444443 | 3 |
| 0.43355324074074075 | 4 |
| 0.4348842592592593 | 5 |
| 0.4350578703703704 | 4 |
| 0.4353935185185185 | 2 |
| 0.43552083333333336 | 5 |
| 0.4357060185185185 | 6 |
| 0.4365046296296296 | 6 |
| 0.4373842592592592 | 7 |
| 0.43870370370370365 | 0 |
| 0.4388310185185185 | 5 |
| 0.43983796296296296 | 7 |
| 0.4398842592592593 | 3 |
| 0.44053240740740746 | 4 |
| 0.440625 | 0 |
| 0.4406481481481481 | 6 |
| 0.4406481481481481 | 1 |
| 0.4406828703703704 | 6 |
| 0.44081018518518517 | 7 |
| 0.4415509259259259 | 7 |
| 0.4419097222222222 | 0 |
| 0.4419328703703704 | 5 |
| 0.442349537037037 | 6 |
| 0.44366898148148143 | 0 |
| 0.4443402777777778 | 1 |
| 0.44437499999999996 | 7 |
| 0.44468749999999996 | 1 |
| 0.44484953703703706 | 2 |
| 0.4458796296296296 | 1 |
| 0.44593750000000004 | 2 |
| 0.44601851851851854 | 3 |
| 0.4461689814814815 | 2 |
| 0.4461921296296296 | 3 |
| 0.4466203703703704 | 2 |
| 0.44690972222222225 | 3 |
| 0.44695601851851857 | 4 |
| 0.4477199074074074 | 0 |
| 0.44795138888888886 | 3 |
| 0.44828703703703704 | 5 |
| 0.4488078703703704 | 1 |
| 0.44912037037037034 | 6 |
| 0.44931712962962966 | 4 |
| 0.4496296296296296 | 4 |
| 0.44971064814814815 | 2 |
| 0.4499421296296296 | 4 |
| 0.45001157407407405 | 5 |
| 0.45070601851851855 | 5 |
| 0.4508101851851852 | 7 |
| 0.4509490740740741 | 3 |
| 0.4510300925925926 | 6 |
| 0.45109953703703703 | 5 |
| 0.4511111111111111 | 6 |
| 0.4512731481481482 | 7 |
| 0.45196759259259256 | 6 |
| 0.4520486111111111 | 0 |
| 0.45214120370370375 | 0 |
| 0.4525115740740741 | 7 |
| 0.4530208333333334 | 0 |
| 0.45313657407407404 | 4 |
| 0.4539814814814815 | 7 |
| 0.4540972222222222 | 1 |
| 0.45418981481481485 | 1 |
| 0.45471064814814816 | 2 |
| 0.4548148148148148 | 1 |
| 0.4551273148148148 | 3 |
| 0.455625 | 2 |
| 0.45576388888888886 | 0 |
| 0.4558101851851852 | 3 |
| 0.45598379629629626 | 1 |
| 0.45689814814814816 | 4 |
| 0.4577893518518519 | 5 |
| 0.4583217592592593 | 2 |
| 0.4586342592592592 | 4 |
| 0.45939814814814817 | 5 |
| 0.4595023148148148 | 3 |
| 0.45987268518518515 | 2 |
| 0.4601388888888889 | 5 |
| 0.4602430555555555 | 6 |
| 0.4605208333333333 | 3 |
| 0.4615046296296296 | 4 |
| 0.4622106481481481 | 6 |
| 0.463125 | 4 |
| 0.464212962962963 | 5 |
| 0.46435185185185185 | 7 |
| 0.46454861111111106 | 6 |
| 0.4646180555555555 | 7 |
| 0.46479166666666666 | 0 |
| 0.465787037037037 | 6 |
| 0.4659490740740741 | 7 |
| 0.46680555555555553 | 5 |
| 0.46751157407407407 | 7 |
| 0.46824074074074074 | 1 |
| 0.4687037037037037 | 0 |
| 0.4688541666666666 | 0 |
| 0.4693055555555556 | 0 |
| 0.469525462962963 | 1 |
| 0.46953703703703703 | 1 |
| 0.4699305555555555 | 6 |
| 0.47019675925925924 | 1 |
| 0.4711574074074074 | 2 |
| 0.471412037037037 | 3 |
| 0.4720949074074074 | 2 |
| 0.4721064814814815 | 7 |
| 0.47269675925925925 | 0 |
| 0.47322916666666665 | 2 |
| 0.4734375 | 2 |
| 0.4737152777777778 | 1 |
| 0.47408564814814813 | 3 |
| 0.47413194444444445 | 3 |
| 0.47458333333333336 | 4 |
| 0.4750810185185185 | 4 |
| 0.47532407407407407 | 3 |
| 0.4763310185185185 | 2 |
| 0.4763888888888889 | 5 |
| 0.47640046296296296 | 6 |
| 0.47657407407407404 | 7 |
| 0.4766435185185185 | 4 |
| 0.4772569444444445 | 3 |
| 0.4773611111111111 | 0 |
| 0.47759259259259257 | 4 |
| 0.47760416666666666 | 5 |
| 0.4780902777777778 | 6 |
| 0.47820601851851857 | 4 |
| 0.479525462962963 | 1 |
| 0.4800578703703704 | 2 |
| 0.4802430555555555 | 5 |
| 0.4804050925925926 | 5 |
| 0.4804745370370371 | 3 |
| 0.4808796296296296 | 6 |
| 0.48090277777777773 | 5 |
| 0.4820486111111111 | 7 |
| 0.4822685185185185 | 4 |
| 0.4830439814814815 | 0 |
| 0.4832986111111111 | 1 |
| 0.48355324074074074 | 6 |
| 0.48418981481481477 | 2 |
| 0.4842361111111111 | 7 |
| 0.48480324074074077 | 5 |
| 0.4850231481481482 | 0 |
| 0.4856712962962963 | 6 |
| 0.48575231481481485 | 7 |
| 0.4860648148148148 | 1 |
| 0.4862037037037037 | 3 |
| 0.4863310185185185 | 0 |
| 0.4869212962962963 | 2 |
| 0.48694444444444446 | 6 |
| 0.48736111111111113 | 1 |
| 0.4875347222222222 | 4 |
| 0.487974537037037 | 3 |
| 0.48976851851851855 | 4 |
| 0.4898263888888889 | 7 |
| 0.48998842592592595 | 2 |
| 0.4900115740740741 | 5 |
| 0.49005787037037035 | 6 |
| 0.4902777777777778 | 0 |
| 0.49050925925925926 | 7 |
| 0.49092592592592593 | 3 |
| 0.491875 | 4 |
| 0.49267361111111113 | 0 |
| 0.4927662037037037 | 1 |
| 0.4936226851851852 | 5 |
| 0.4936805555555555 | 2 |
| 0.49378472222222225 | 1 |
| 0.49413194444444447 | 7 |
| 0.4942939814814815 | 3 |
| 0.4945949074074074 | 5 |
| 0.4952430555555556 | 0 |
| 0.49530092592592595 | 4 |
| 0.4955092592592592 | 6 |
| 0.4961226851851852 | 1 |
| 0.496400462962963 | 7 |
| 0.4967592592592593 | 0 |
| 0.49722222222222223 | 5 |
| 0.4974189814814815 | 6 |
| 0.4976967592592592 | 2 |
| 0.49975694444444446 | 3 |
| 0.5 | 7 |
| 0.5004282407407408 | 2 |
| 0.5005439814814815 | 3 |
| 0.5006712962962964 | 6 |
| 0.5008101851851852 | 1 |
| 0.5015625 | 2 |
| 0.5017013888888889 | 0 |
| 0.5018634259259259 | 3 |
| 0.5019097222222222 | 4 |
| 0.5023148148148148 | 4 |
| 0.5032638888888888 | 5 |
| 0.503275462962963 | 5 |
| 0.5037731481481481 | 6 |
| 0.5041087962962963 | 6 |
| 0.5042592592592593 | 7 |
| 0.5058449074074074 | 7 |
| 0.5064351851851852 | 0 |
| 0.5064583333333333 | 1 |
| 0.5065277777777778 | 1 |
| 0.5069791666666666 | 2 |
| 0.5070949074074075 | 4 |
| 0.507199074074074 | 0 |
| 0.5074421296296296 | 2 |
| 0.5077546296296297 | 5 |
| 0.5077893518518518 | 7 |
| 0.5080671296296296 | 3 |
| 0.5088078703703703 | 0 |
| 0.5088773148148148 | 6 |
| 0.5090625 | 1 |
| 0.5090856481481482 | 4 |
| 0.5091898148148148 | 1 |
| 0.5099652777777778 | 2 |
| 0.510775462962963 | 3 |
| 0.5110185185185185 | 5 |
| 0.5112152777777778 | 6 |
| 0.5115972222222221 | 4 |
| 0.5118634259259259 | 5 |
| 0.5120023148148148 | 3 |
| 0.5124768518518519 | 7 |
| 0.5129513888888889 | 6 |
| 0.5133564814814815 | 4 |
| 0.5134953703703703 | 2 |
| 0.5138078703703703 | 7 |
| 0.5146990740740741 | 3 |
| 0.5147800925925926 | 0 |
| 0.5152777777777778 | 7 |
| 0.5155208333333333 | 0 |
| 0.5156018518518518 | 0 |
| 0.5158680555555556 | 5 |
| 0.5159143518518519 | 6 |
| 0.5169328703703704 | 1 |
| 0.5175925925925926 | 2 |
| 0.5178125 | 3 |
| 0.5184027777777778 | 4 |
| 0.5187962962962963 | 4 |
| 0.5195023148148148 | 5 |
| 0.5198379629629629 | 6 |
| 0.5200462962962963 | 7 |
| 0.5203009259259259 | 1 |
| 0.5205671296296296 | 5 |
| 0.5208333333333334 | 2 |
| 0.5211689814814815 | 0 |
| 0.5216087962962963 | 6 |
| 0.5220486111111111 | 1 |
| 0.5220717592592593 | 1 |
| 0.5228703703703704 | 7 |
| 0.5232754629629629 | 2 |
| 0.5246412037037037 | 3 |
| 0.5246412037037037 | 3 |
| 0.5246990740740741 | 0 |
| 0.5247569444444444 | 4 |
| 0.5249189814814815 | 1 |
| 0.5254745370370371 | 4 |
| 0.5255902777777778 | 7 |
| 0.5257407407407407 | 5 |
| 0.5264351851851852 | 2 |
| 0.5265509259259259 | 3 |
| 0.5268287037037037 | 6 |
| 0.5273148148148148 | 5 |
| 0.5284953703703704 | 6 |
| 0.528912037037037 | 2 |
| 0.5289930555555555 | 0 |
| 0.5291782407407407 | 7 |
| 0.5291782407407407 | 1 |
| 0.5295023148148148 | 0 |
| 0.5295833333333334 | 3 |
| 0.5296064814814815 | 2 |
| 0.5305902777777778 | 4 |
| 0.5331944444444444 | 4 |
| 0.5334837962962963 | 7 |
| 0.5338773148148148 | 5 |
| 0.5340277777777778 | 0 |
| 0.5342939814814814 | 1 |
| 0.5345023148148148 | 2 |
| 0.535 | 6 |
| 0.5359837962962963 | 1 |
| 0.5360300925925926 | 5 |
| 0.5372222222222222 | 2 |
| 0.5382291666666666 | 3 |
| 0.538599537037037 | 3 |
| 0.5386574074074074 | 7 |
| 0.5387152777777778 | 4 |
| 0.5388194444444444 | 4 |
| 0.539074074074074 | 3 |
| 0.5392361111111111 | 6 |
| 0.5395949074074075 | 4 |
| 0.5404513888888889 | 5 |
| 0.5409953703703704 | 0 |
| 0.5412847222222222 | 5 |
| 0.5414699074074074 | 7 |
| 0.5418518518518519 | 5 |
| 0.541863425925926 | 6 |
| 0.5420601851851852 | 0 |
| 0.5424652777777778 | 6 |
| 0.5431134259259259 | 1 |
| 0.5431712962962963 | 1 |
| 0.5438425925925926 | 2 |
| 0.5440625 | 3 |
| 0.5443402777777778 | 7 |
| 0.5444560185185185 | 6 |
| 0.5450694444444445 | 4 |
| 0.5457986111111112 | 2 |
| 0.5461689814814815 | 0 |
| 0.5467476851851852 | 3 |
| 0.546863425925926 | 5 |
| 0.5471990740740741 | 1 |
| 0.547488425925926 | 7 |
| 0.5477199074074074 | 4 |
| 0.5479166666666667 | 6 |
| 0.5480324074074074 | 0 |
| 0.5483101851851852 | 1 |
| 0.5485185185185185 | 2 |
| 0.5499305555555556 | 2 |
| 0.5504513888888889 | 3 |
| 0.5504861111111111 | 5 |
| 0.5516898148148148 | 7 |
| 0.5519675925925925 | 7 |
| 0.5520833333333334 | 4 |
| 0.5522685185185185 | 3 |
| 0.5528587962962963 | 4 |
| 0.5548842592592592 | 5 |
| 0.5549768518518519 | 0 |
| 0.5551157407407408 | 1 |
| 0.5554166666666667 | 0 |
| 0.5556018518518518 | 1 |
| 0.5559143518518518 | 5 |
| 0.5560300925925926 | 2 |
| 0.5560763888888889 | 6 |
| 0.556412037037037 | 2 |
| 0.5566898148148148 | 6 |
| 0.5577546296296296 | 3 |
| 0.5585300925925926 | 6 |
| 0.5593981481481481 | 7 |
| 0.5595023148148148 | 0 |
| 0.5603472222222222 | 7 |
| 0.5606481481481481 | 4 |
| 0.5612037037037038 | 1 |
| 0.5625694444444445 | 0 |
| 0.5626620370370371 | 1 |
| 0.5627083333333334 | 5 |
| 0.5628703703703704 | 2 |
| 0.563599537037037 | 2 |
| 0.5636574074074074 | 3 |
| 0.564236111111111 | 3 |
| 0.5652314814814815 | 6 |
| 0.5652662037037037 | 4 |
| 0.5656481481481481 | 3 |
| 0.5658101851851852 | 7 |
| 0.5661574074074074 | 7 |
| 0.5661689814814815 | 4 |
| 0.567037037037037 | 5 |
| 0.5672337962962963 | 5 |
| 0.5674421296296296 | 6 |
| 0.5684606481481481 | 6 |
| 0.5691087962962963 | 0 |
| 0.5692592592592592 | 1 |
| 0.5695601851851851 | 4 |
| 0.5700810185185184 | 7 |
| 0.5705555555555556 | 2 |
| 0.5709837962962964 | 7 |
| 0.5718287037037036 | 0 |
| 0.5719097222222222 | 3 |
| 0.5728356481481481 | 0 |
| 0.5738773148148147 | 1 |
| 0.5748148148148148 | 4 |
| 0.5756365740740741 | 5 |
| 0.5756597222222223 | 6 |
| 0.5766550925925926 | 2 |
| 0.5767129629629629 | 1 |
| 0.5768865740740741 | 5 |
| 0.5771875 | 3 |
| 0.5772453703703704 | 2 |
| 0.5775925925925925 | 7 |
| 0.5788310185185185 | 4 |
| 0.5790856481481481 | 0 |
| 0.5793402777777777 | 0 |
| 0.5794328703703704 | 6 |
| 0.5803587962962963 | 7 |
| 0.5811342592592593 | 3 |
| 0.5816782407407407 | 5 |
| 0.5819907407407408 | 4 |
| 0.5822569444444444 | 5 |
| 0.5828935185185186 | 6 |
| 0.5833680555555555 | 6 |
| 0.5838310185185185 | 1 |
| 0.5846296296296296 | 2 |
| 0.585150462962963 | 3 |
| 0.5857638888888889 | 7 |
| 0.586087962962963 | 0 |
| 0.58625 | 7 |
| 0.5863194444444445 | 4 |
| 0.5863657407407408 | 0 |
| 0.586412037037037 | 1 |
| 0.5872106481481482 | 2 |
| 0.5880902777777778 | 1 |
| 0.5889351851851852 | 3 |
| 0.5891666666666667 | 4 |
| 0.5897800925925926 | 2 |
| 0.5905787037037037 | 3 |
| 0.5915740740740741 | 5 |
| 0.5927083333333333 | 1 |
| 0.5928935185185186 | 5 |
| 0.5936226851851852 | 0 |
| 0.5938657407407407 | 6 |
| 0.5939699074074074 | 2 |
| 0.5941203703703704 | 7 |
| 0.5953472222222222 | 6 |
| 0.5953703703703704 | 3 |
| 0.5954976851851852 | 4 |
| 0.5959722222222222 | 0 |
| 0.596574074074074 | 4 |
| 0.5976388888888889 | 1 |
| 0.5977199074074074 | 2 |
| 0.5981134259259259 | 5 |
| 0.5981365740740741 | 1 |
| 0.5986689814814815 | 7 |
| 0.5989467592592593 | 2 |
| 0.5993171296296297 | 6 |
| 0.599363425925926 | 3 |
| 0.5994675925925926 | 3 |
| 0.5994791666666667 | 0 |
| 0.5996643518518519 | 4 |
| 0.6006365740740741 | 4 |
| 0.6007060185185186 | 5 |
| 0.6022685185185185 | 1 |
| 0.6023379629629629 | 2 |
| 0.6027314814814815 | 5 |
| 0.6027662037037037 | 6 |
| 0.6041087962962963 | 3 |
| 0.6044444444444445 | 7 |
| 0.6047222222222223 | 7 |
| 0.605 | 0 |
| 0.6052777777777778 | 1 |
| 0.6052777777777778 | 6 |
| 0.6054861111111111 | 2 |
| 0.6059259259259259 | 5 |
| 0.6062268518518519 | 7 |
| 0.6062268518518519 | 0 |
| 0.6072337962962963 | 0 |
| 0.6075810185185185 | 1 |
| 0.6082407407407407 | 6 |
| 0.6084837962962962 | 7 |
| 0.6093171296296297 | 3 |
| 0.6097569444444445 | 2 |
| 0.6099189814814815 | 4 |
| 0.6101273148148149 | 4 |
| 0.6103587962962963 | 0 |
| 0.6111921296296297 | 5 |
| 0.6116898148148148 | 3 |
| 0.6120138888888889 | 6 |
| 0.612037037037037 | 1 |
| 0.6121064814814815 | 2 |
| 0.6123263888888889 | 7 |
| 0.6123958333333334 | 0 |
| 0.6130324074074074 | 5 |
| 0.6136574074074074 | 1 |
| 0.6137615740740741 | 3 |
| 0.6140740740740741 | 4 |
| 0.6144791666666667 | 2 |
| 0.6151157407407407 | 5 |
| 0.6157060185185185 | 6 |
| 0.6162268518518519 | 3 |
| 0.6164583333333333 | 4 |
| 0.6197106481481481 | 6 |
| 0.6202430555555556 | 5 |
| 0.6205555555555555 | 4 |
| 0.6206712962962962 | 7 |
| 0.6213657407407408 | 5 |
| 0.6216782407407407 | 0 |
| 0.6218981481481481 | 6 |
| 0.622037037037037 | 1 |
| 0.6227314814814815 | 6 |
| 0.6231365740740741 | 7 |
| 0.6242245370370371 | 2 |
| 0.626099537037037 | 7 |
| 0.6261689814814815 | 3 |
| 0.6265046296296296 | 0 |
| 0.6266550925925926 | 1 |
| 0.6269212962962963 | 0 |
| 0.6279861111111111 | 2 |
| 0.6293634259259259 | 3 |
| 0.6297569444444444 | 1 |
| 0.6298263888888889 | 2 |
| 0.6300462962962963 | 1 |
| 0.6312268518518519 | 2 |
| 0.6314583333333333 | 3 |
| 0.6316087962962963 | 3 |
| 0.6323263888888889 | 4 |
| 0.6339814814814815 | 4 |
| 0.6342361111111111 | 5 |
| 0.6344444444444445 | 5 |
| 0.635 | 7 |
| 0.6350810185185185 | 4 |
| 0.6358912037037037 | 5 |
| 0.6359027777777778 | 6 |
| 0.6359374999999999 | 7 |
| 0.6364351851851852 | 6 |
| 0.6365277777777778 | 0 |
| 0.6370254629629629 | 6 |
| 0.6377199074074075 | 4 |
| 0.6379861111111111 | 7 |
| 0.6380208333333334 | 1 |
| 0.6381597222222223 | 0 |
| 0.6385069444444444 | 1 |
| 0.6388078703703703 | 5 |
| 0.6391319444444444 | 2 |
| 0.6396412037037037 | 6 |
| 0.6399537037037036 | 7 |
| 0.6400231481481481 | 0 |
| 0.6402546296296296 | 3 |
| 0.6416319444444444 | 2 |
| 0.6418402777777777 | 4 |
| 0.6419328703703704 | 5 |
| 0.6419560185185186 | 6 |
| 0.6422106481481481 | 7 |
| 0.6428125 | 3 |
| 0.6440277777777778 | 0 |
| 0.6440856481481482 | 5 |
| 0.645474537037037 | 1 |
| 0.6458796296296296 | 2 |
| 0.6468171296296296 | 3 |
| 0.6485185185185185 | 4 |
| 0.6493287037037038 | 5 |
| 0.6496180555555556 | 7 |
| 0.6498032407407407 | 6 |
| 0.6515162037037037 | 6 |
| 0.6515162037037037 | 0 |
| 0.6527893518518518 | 0 |
| 0.6531481481481481 | 1 |
| 0.6534606481481481 | 7 |
| 0.6537731481481481 | 2 |
| 0.6539351851851852 | 0 |
| 0.6549074074074074 | 3 |
| 0.6561111111111111 | 1 |
| 0.6564930555555556 | 4 |
| 0.6565972222222222 | 5 |
| 0.6566203703703704 | 6 |
| 0.656863425925926 | 7 |
| 0.6569444444444444 | 2 |
| 0.6571064814814814 | 1 |
| 0.6574768518518518 | 3 |
| 0.6579282407407407 | 1 |
| 0.6586689814814815 | 4 |
| 0.6587037037037037 | 0 |
| 0.6589351851851851 | 2 |
| 0.6590625 | 7 |
| 0.6591319444444445 | 2 |
| 0.6592361111111111 | 0 |
| 0.6593634259259259 | 3 |
| 0.6594328703703703 | 3 |
| 0.6598032407407407 | 4 |
| 0.660150462962963 | 1 |
| 0.6604629629629629 | 1 |
| 0.6605092592592593 | 5 |
| 0.6605671296296296 | 2 |
| 0.6615046296296296 | 3 |
| 0.6617592592592593 | 2 |
| 0.6619212962962963 | 4 |
| 0.6621875 | 5 |
| 0.6632060185185186 | 4 |
| 0.6632870370370371 | 3 |
| 0.6634143518518518 | 4 |
| 0.6638657407407408 | 6 |
| 0.663912037037037 | 7 |
| 0.6640046296296297 | 6 |
| 0.6640277777777778 | 5 |
| 0.6640625 | 5 |
| 0.6641087962962963 | 7 |
| 0.6641782407407407 | 5 |
| 0.6645023148148148 | 0 |
| 0.6645023148148148 | 6 |
| 0.664513888888889 | 0 |
| 0.6660185185185185 | 1 |
| 0.6664236111111111 | 6 |
| 0.6666782407407408 | 7 |
| 0.6673611111111111 | 6 |
| 0.6675231481481482 | 1 |
| 0.6679282407407406 | 7 |
| 0.6681944444444444 | 7 |
| 0.6685879629629629 | 0 |
| 0.6686689814814816 | 0 |
| 0.6695833333333333 | 2 |
| 0.6696875000000001 | 2 |
| 0.6703009259259259 | 1 |
| 0.6703703703703704 | 2 |
| 0.6704166666666667 | 3 |
| 0.6704282407407408 | 0 |
| 0.6708217592592592 | 4 |
| 0.6708796296296297 | 3 |
| 0.67125 | 1 |
| 0.6714583333333333 | 2 |
| 0.6715046296296295 | 4 |
| 0.6718518518518519 | 1 |
| 0.6720601851851852 | 3 |
| 0.6721412037037037 | 3 |
| 0.6721759259259259 | 5 |
| 0.6721990740740741 | 5 |
| 0.6723726851851852 | 4 |
| 0.6725231481481481 | 4 |
| 0.6734375 | 5 |
| 0.6737037037037038 | 2 |
| 0.6741898148148149 | 3 |
| 0.6745023148148147 | 5 |
| 0.6745717592592593 | 4 |
| 0.6749768518518519 | 6 |
| 0.6752777777777778 | 5 |
| 0.6768171296296296 | 7 |
| 0.6772916666666666 | 0 |
| 0.678136574074074 | 6 |
| 0.6787847222222222 | 6 |
| 0.6788310185185185 | 1 |
| 0.6788773148148147 | 6 |
| 0.678900462962963 | 7 |
| 0.6791087962962963 | 7 |
| 0.6791203703703704 | 7 |
| 0.6793055555555556 | 0 |
| 0.6796412037037037 | 0 |
| 0.6797106481481481 | 6 |
| 0.680138888888889 | 0 |
| 0.6804976851851853 | 1 |
| 0.6815625000000001 | 2 |
| 0.6823263888888889 | 1 |
| 0.682673611111111 | 1 |
| 0.6827314814814814 | 2 |
| 0.6828009259259259 | 2 |
| 0.6830208333333333 | 3 |
| 0.6843981481481481 | 2 |
| 0.6847222222222222 | 3 |
| 0.6852199074074075 | 4 |
| 0.6852546296296297 | 3 |
| 0.6856481481481481 | 4 |
| 0.687037037037037 | 5 |
| 0.6871759259259259 | 3 |
| 0.6872337962962963 | 4 |
| 0.6873726851851852 | 7 |
| 0.6875347222222222 | 0 |
| 0.6887847222222222 | 1 |
| 0.6895833333333333 | 5 |
| 0.6900925925925926 | 2 |
| 0.6916550925925926 | 3 |
| 0.6917708333333333 | 4 |
| 0.6923611111111111 | 5 |
| 0.6924537037037037 | 6 |
| 0.6925462962962964 | 5 |
| 0.6934143518518519 | 7 |
| 0.693761574074074 | 6 |
| 0.6938194444444444 | 4 |
| 0.6940046296296297 | 7 |
| 0.694525462962963 | 0 |
| 0.6946412037037036 | 5 |
| 0.6951967592592593 | 6 |
| 0.695787037037037 | 6 |
| 0.6963541666666666 | 7 |
| 0.6965625000000001 | 0 |
| 0.6975694444444445 | 1 |
| 0.6977083333333334 | 2 |
| 0.6977083333333334 | 1 |
| 0.6988888888888889 | 0 |
| 0.6991550925925926 | 6 |
| 0.6997222222222222 | 1 |
| 0.6999421296296297 | 2 |
| 0.7001157407407407 | 2 |
| 0.700462962962963 | 7 |
| 0.700625 | 3 |
| 0.7010185185185186 | 4 |
| 0.7021064814814815 | 3 |
| 0.7021643518518519 | 4 |
| 0.7030208333333333 | 5 |
| 0.7035069444444444 | 6 |
| 0.7052083333333333 | 3 |
| 0.7053819444444445 | 7 |
| 0.7058564814814815 | 0 |
| 0.7073263888888889 | 5 |
| 0.7074189814814815 | 1 |
| 0.7086458333333333 | 7 |
| 0.7094444444444444 | 4 |
| 0.7101851851851851 | 2 |
| 0.7116666666666666 | 3 |
| 0.711875 | 0 |
| 0.7122453703703703 | 1 |
| 0.7128819444444444 | 2 |
| 0.7131018518518518 | 5 |
| 0.7135416666666666 | 0 |
| 0.713900462962963 | 4 |
| 0.7140393518518519 | 3 |
| 0.7141550925925926 | 6 |
| 0.7151736111111111 | 1 |
| 0.715474537037037 | 7 |
| 0.7156597222222222 | 4 |
| 0.715763888888889 | 5 |
| 0.715787037037037 | 6 |
| 0.7160416666666666 | 7 |
| 0.7172106481481482 | 2 |
| 0.7172916666666667 | 6 |
| 0.7177314814814815 | 7 |
| 0.7179166666666666 | 0 |
| 0.7182291666666667 | 3 |
| 0.7183217592592593 | 5 |
| 0.7190277777777778 | 0 |
| 0.7190625 | 1 |
| 0.7193865740740741 | 1 |
| 0.7198032407407408 | 2 |
| 0.7205787037037038 | 2 |
| 0.7207754629629629 | 3 |
| 0.721238425925926 | 6 |
| 0.7222106481481482 | 7 |
| 0.7225115740740741 | 4 |
| 0.7227083333333333 | 3 |
| 0.7233449074074074 | 5 |
| 0.7238310185185185 | 6 |
| 0.724849537037037 | 4 |
| 0.7253935185185184 | 0 |
| 0.7258680555555556 | 5 |
| 0.7265625 | 1 |
| 0.7267592592592593 | 4 |
| 0.7275925925925927 | 7 |
| 0.7280787037037038 | 0 |
| 0.7285648148148148 | 6 |
| 0.7286342592592593 | 0 |
| 0.7290046296296296 | 2 |
| 0.7295138888888889 | 5 |
| 0.7302662037037037 | 1 |
| 0.7311689814814816 | 7 |
| 0.7313310185185186 | 1 |
| 0.7320254629629629 | 0 |
| 0.7323148148148149 | 2 |
| 0.7325462962962962 | 6 |
| 0.732986111111111 | 1 |
| 0.7332060185185186 | 2 |
| 0.7333449074074073 | 3 |
| 0.7337152777777778 | 3 |
| 0.7340972222222222 | 4 |
| 0.7341782407407407 | 3 |
| 0.7343981481481481 | 7 |
| 0.734826388888889 | 5 |
| 0.7359143518518518 | 2 |
| 0.7384027777777779 | 6 |
| 0.738460648148148 | 4 |
| 0.7385185185185185 | 7 |
| 0.7387384259259259 | 3 |
| 0.7389236111111112 | 0 |
| 0.7409953703703703 | 4 |
| 0.7410185185185186 | 0 |
| 0.7414351851851851 | 1 |
| 0.7416435185185185 | 5 |
| 0.7416898148148148 | 2 |
| 0.7418865740740741 | 6 |
| 0.7419328703703704 | 4 |
| 0.7420138888888889 | 1 |
| 0.7421875 | 5 |
| 0.7438888888888888 | 7 |
| 0.7441319444444444 | 2 |
| 0.7445717592592592 | 3 |
| 0.7446990740740741 | 5 |
| 0.744988425925926 | 3 |
| 0.7453472222222222 | 0 |
| 0.7454050925925926 | 4 |
| 0.7454745370370371 | 4 |
| 0.7459606481481481 | 5 |
| 0.7464236111111111 | 6 |
| 0.7468171296296297 | 5 |
| 0.7468750000000001 | 7 |
| 0.7477546296296297 | 6 |
| 0.7479282407407407 | 1 |
| 0.7481944444444445 | 0 |
| 0.7482291666666666 | 1 |
| 0.7490162037037037 | 6 |
| 0.7496064814814815 | 7 |
| 0.7496643518518519 | 7 |
| 0.7497685185185184 | 2 |
| 0.7502662037037037 | 2 |
| 0.751724537037037 | 3 |
| 0.7519328703703704 | 3 |
| 0.7536689814814815 | 6 |
| 0.7539236111111111 | 7 |
| 0.7540972222222222 | 4 |
| 0.7544560185185185 | 0 |
| 0.7544791666666667 | 4 |
| 0.7546643518518518 | 5 |
| 0.7550462962962964 | 6 |
| 0.7550810185185185 | 0 |
| 0.7551273148148149 | 5 |
| 0.7557754629629629 | 1 |
| 0.7558680555555556 | 2 |
| 0.756261574074074 | 0 |
| 0.7564814814814814 | 7 |
| 0.7567013888888888 | 1 |
| 0.7569444444444445 | 2 |
| 0.7572569444444445 | 0 |
| 0.7575694444444445 | 1 |
| 0.7576967592592593 | 2 |
| 0.7578703703703704 | 6 |
| 0.7590046296296297 | 3 |
| 0.7598379629629629 | 3 |
| 0.7605092592592593 | 7 |
| 0.7607523148148148 | 4 |
| 0.7608449074074074 | 4 |
| 0.7612152777777778 | 5 |
| 0.76125 | 5 |
| 0.7613773148148147 | 0 |
| 0.7621875 | 3 |
| 0.7622453703703704 | 4 |
| 0.762349537037037 | 1 |
| 0.7643171296296297 | 6 |
| 0.7649652777777778 | 7 |
| 0.7653240740740741 | 2 |
| 0.767511574074074 | 5 |
| 0.7681828703703704 | 3 |
| 0.7692476851851852 | 6 |
| 0.769849537037037 | 1 |
| 0.7704166666666666 | 0 |
| 0.770474537037037 | 4 |
| 0.7707986111111111 | 2 |
| 0.7711226851851851 | 1 |
| 0.7711342592592593 | 5 |
| 0.7712037037037037 | 2 |
| 0.7713773148148149 | 6 |
| 0.7719212962962962 | 3 |
| 0.7734027777777778 | 7 |
| 0.7743171296296296 | 4 |
| 0.774375 | 3 |
| 0.7744791666666666 | 6 |
| 0.7746296296296297 | 7 |
| 0.7746527777777777 | 0 |
| 0.7748958333333333 | 0 |
| 0.7754629629629629 | 5 |
| 0.7757407407407407 | 1 |
| 0.7758217592592592 | 7 |
| 0.7762152777777778 | 4 |
| 0.7765856481481482 | 5 |
| 0.7775 | 1 |
| 0.7784722222222222 | 6 |
| 0.7784837962962964 | 2 |
| 0.7798842592592593 | 2 |
| 0.7808101851851852 | 7 |
| 0.7813541666666667 | 3 |
| 0.7814004629629631 | 3 |
| 0.7826504629629629 | 0 |
| 0.7832523148148148 | 1 |
| 0.7835069444444445 | 2 |
| 0.7839583333333334 | 3 |
| 0.7841435185185185 | 4 |
| 0.7843287037037037 | 5 |
| 0.7846759259259258 | 6 |
| 0.7847222222222222 | 6 |
| 0.7861805555555555 | 7 |
| 0.7869675925925925 | 0 |
| 0.7888078703703704 | 4 |
| 0.7892476851851852 | 0 |
| 0.7892939814814816 | 4 |
| 0.7900810185185185 | 7 |
| 0.7901041666666666 | 0 |
| 0.7909143518518519 | 1 |
| 0.7912037037037036 | 1 |
| 0.7914120370370371 | 5 |
| 0.7918981481481482 | 5 |
| 0.7921527777777778 | 6 |
| 0.7929513888888889 | 7 |
| 0.7930092592592594 | 2 |
| 0.7939583333333333 | 2 |
| 0.794050925925926 | 3 |
| 0.7941435185185185 | 6 |
| 0.7943402777777777 | 0 |
| 0.7968981481481481 | 3 |
| 0.7970833333333333 | 1 |
| 0.798263888888889 | 7 |
| 0.7992824074074073 | 0 |
| 0.7996643518518519 | 1 |
| 0.7997453703703704 | 1 |
| 0.7999652777777778 | 2 |
| 0.8007060185185185 | 2 |
| 0.8009027777777779 | 2 |
| 0.8018402777777779 | 3 |
| 0.8028124999999999 | 4 |
| 0.8034953703703703 | 3 |
| 0.8042708333333333 | 4 |
| 0.8043518518518519 | 4 |
| 0.8054282407407407 | 5 |
| 0.8056481481481481 | 5 |
| 0.8069675925925925 | 5 |
| 0.8076851851851852 | 4 |
| 0.8084837962962963 | 6 |
| 0.8085532407407406 | 3 |
| 0.80875 | 6 |
| 0.8089814814814815 | 5 |
| 0.8097106481481481 | 6 |
| 0.8104629629629629 | 6 |
| 0.8106481481481481 | 7 |
| 0.8108564814814815 | 7 |
| 0.8109606481481482 | 4 |
| 0.8112037037037036 | 7 |
| 0.8116666666666666 | 5 |
| 0.8121990740740741 | 0 |
| 0.8126967592592593 | 6 |
| 0.8127199074074074 | 0 |
| 0.8127777777777778 | 1 |
| 0.8133449074074074 | 1 |
| 0.8135879629629629 | 2 |
| 0.8137847222222222 | 7 |
| 0.8138541666666667 | 7 |
| 0.814050925925926 | 3 |
| 0.8140972222222222 | 0 |
| 0.8142939814814815 | 2 |
| 0.8148842592592592 | 0 |
| 0.8152662037037036 | 1 |
| 0.8165162037037037 | 2 |
| 0.8174421296296296 | 0 |
| 0.8178819444444444 | 1 |
| 0.818136574074074 | 2 |
| 0.8185416666666666 | 3 |
| 0.8194560185185185 | 4 |
| 0.8197685185185185 | 1 |
| 0.8210879629629629 | 3 |
| 0.821574074074074 | 4 |
| 0.8220138888888888 | 4 |
| 0.8221064814814815 | 5 |
| 0.8223611111111112 | 6 |
| 0.8225231481481482 | 5 |
| 0.8231712962962963 | 7 |
| 0.8234490740740741 | 2 |
| 0.8240625 | 5 |
| 0.824212962962963 | 3 |
| 0.8245833333333333 | 0 |
| 0.8248148148148148 | 3 |
| 0.8253935185185185 | 6 |
| 0.8256597222222223 | 6 |
| 0.8258333333333333 | 4 |
| 0.8261458333333334 | 5 |
| 0.8263194444444445 | 7 |
| 0.8264583333333334 | 6 |
| 0.8266319444444444 | 4 |
| 0.827337962962963 | 5 |
| 0.8273611111111111 | 1 |
| 0.8282523148148148 | 7 |
| 0.8283796296296296 | 6 |
| 0.8293055555555555 | 7 |
| 0.8294675925925926 | 7 |
| 0.8297916666666666 | 0 |
| 0.8302893518518518 | 2 |
| 0.8304398148148149 | 0 |
| 0.831875 | 0 |
| 0.8321064814814815 | 0 |
| 0.8326041666666667 | 1 |
| 0.8326851851851852 | 2 |
| 0.8338657407407407 | 3 |